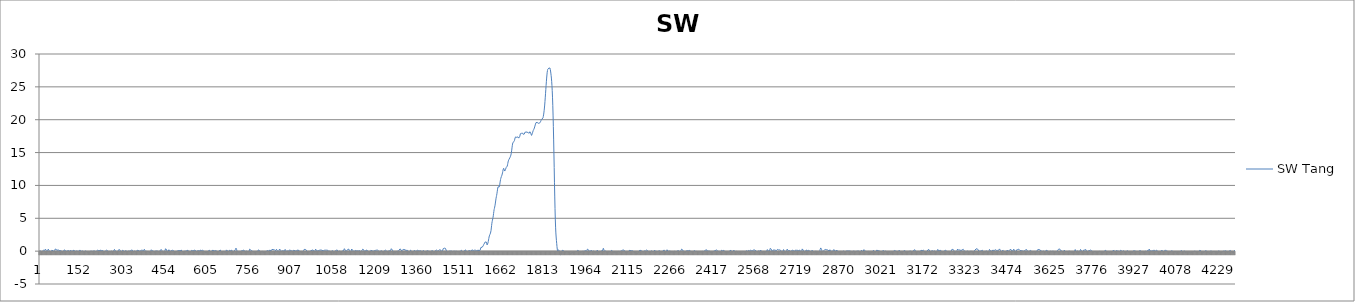
| Category | SW Tang |
|---|---|
| 0 | 0.11 |
| 1 | 0.13 |
| 2 | 0.06 |
| 3 | -0.02 |
| 4 | -0.09 |
| 5 | -0.11 |
| 6 | -0.11 |
| 7 | -0.04 |
| 8 | -0.02 |
| 9 | 0.02 |
| 10 | 0.09 |
| 11 | 0.11 |
| 12 | 0.13 |
| 13 | 0.13 |
| 14 | 0.13 |
| 15 | 0.11 |
| 16 | 0.11 |
| 17 | 0.15 |
| 18 | 0.19 |
| 19 | 0.3 |
| 20 | 0.28 |
| 21 | 0.21 |
| 22 | 0.09 |
| 23 | -0.09 |
| 24 | -0.17 |
| 25 | -0.17 |
| 26 | -0.09 |
| 27 | 0.06 |
| 28 | 0.21 |
| 29 | 0.3 |
| 30 | 0.28 |
| 31 | 0.24 |
| 32 | 0.09 |
| 33 | -0.02 |
| 34 | -0.13 |
| 35 | -0.21 |
| 36 | -0.19 |
| 37 | -0.15 |
| 38 | -0.06 |
| 39 | 0.02 |
| 40 | 0.09 |
| 41 | 0.09 |
| 42 | 0.13 |
| 43 | 0.11 |
| 44 | 0.13 |
| 45 | 0.09 |
| 46 | 0.06 |
| 47 | 0 |
| 48 | -0.06 |
| 49 | -0.09 |
| 50 | -0.09 |
| 51 | -0.02 |
| 52 | 0.09 |
| 53 | 0.21 |
| 54 | 0.32 |
| 55 | 0.41 |
| 56 | 0.41 |
| 57 | 0.39 |
| 58 | 0.26 |
| 59 | 0.17 |
| 60 | 0.09 |
| 61 | 0.04 |
| 62 | 0.09 |
| 63 | 0.15 |
| 64 | 0.21 |
| 65 | 0.28 |
| 66 | 0.26 |
| 67 | 0.19 |
| 68 | 0.09 |
| 69 | 0 |
| 70 | -0.02 |
| 71 | 0 |
| 72 | 0.09 |
| 73 | 0.13 |
| 74 | 0.15 |
| 75 | 0.13 |
| 76 | 0.04 |
| 77 | -0.06 |
| 78 | -0.15 |
| 79 | -0.26 |
| 80 | -0.32 |
| 81 | -0.32 |
| 82 | -0.28 |
| 83 | -0.17 |
| 84 | -0.02 |
| 85 | 0.11 |
| 86 | 0.19 |
| 87 | 0.26 |
| 88 | 0.21 |
| 89 | 0.19 |
| 90 | 0.11 |
| 91 | 0.06 |
| 92 | -0.02 |
| 93 | -0.06 |
| 94 | -0.04 |
| 95 | -0.04 |
| 96 | 0 |
| 97 | 0.02 |
| 98 | 0.02 |
| 99 | 0.04 |
| 100 | 0.06 |
| 101 | 0.09 |
| 102 | 0.09 |
| 103 | 0.06 |
| 104 | 0 |
| 105 | -0.04 |
| 106 | -0.04 |
| 107 | 0 |
| 108 | 0.11 |
| 109 | 0.15 |
| 110 | 0.17 |
| 111 | 0.09 |
| 112 | -0.02 |
| 113 | -0.13 |
| 114 | -0.17 |
| 115 | -0.15 |
| 116 | -0.04 |
| 117 | 0.04 |
| 118 | 0.13 |
| 119 | 0.13 |
| 120 | 0.13 |
| 121 | 0.11 |
| 122 | 0.09 |
| 123 | 0.06 |
| 124 | 0.04 |
| 125 | 0 |
| 126 | -0.04 |
| 127 | -0.11 |
| 128 | -0.09 |
| 129 | -0.09 |
| 130 | 0.02 |
| 131 | 0.04 |
| 132 | 0.06 |
| 133 | 0.02 |
| 134 | -0.02 |
| 135 | -0.09 |
| 136 | -0.15 |
| 137 | -0.15 |
| 138 | -0.06 |
| 139 | 0.02 |
| 140 | 0.11 |
| 141 | 0.17 |
| 142 | 0.19 |
| 143 | 0.17 |
| 144 | 0.11 |
| 145 | 0.04 |
| 146 | -0.02 |
| 147 | -0.04 |
| 148 | -0.04 |
| 149 | 0 |
| 150 | 0.02 |
| 151 | 0.06 |
| 152 | 0.04 |
| 153 | 0.04 |
| 154 | -0.04 |
| 155 | -0.13 |
| 156 | -0.17 |
| 157 | -0.21 |
| 158 | -0.21 |
| 159 | -0.13 |
| 160 | -0.04 |
| 161 | 0.02 |
| 162 | 0.04 |
| 163 | 0.06 |
| 164 | 0 |
| 165 | -0.02 |
| 166 | -0.06 |
| 167 | -0.11 |
| 168 | -0.17 |
| 169 | -0.19 |
| 170 | -0.24 |
| 171 | -0.26 |
| 172 | -0.3 |
| 173 | -0.3 |
| 174 | -0.28 |
| 175 | -0.26 |
| 176 | -0.19 |
| 177 | -0.13 |
| 178 | -0.09 |
| 179 | -0.06 |
| 180 | -0.04 |
| 181 | -0.02 |
| 182 | 0.02 |
| 183 | 0.02 |
| 184 | 0.04 |
| 185 | -0.02 |
| 186 | -0.06 |
| 187 | -0.11 |
| 188 | -0.15 |
| 189 | -0.09 |
| 190 | 0 |
| 191 | 0.09 |
| 192 | 0.11 |
| 193 | 0.06 |
| 194 | 0.02 |
| 195 | -0.02 |
| 196 | -0.04 |
| 197 | -0.04 |
| 198 | -0.06 |
| 199 | -0.04 |
| 200 | -0.06 |
| 201 | -0.02 |
| 202 | 0 |
| 203 | 0.02 |
| 204 | 0.09 |
| 205 | 0.13 |
| 206 | 0.15 |
| 207 | 0.15 |
| 208 | 0.13 |
| 209 | 0.09 |
| 210 | 0.06 |
| 211 | 0.02 |
| 212 | 0 |
| 213 | 0 |
| 214 | 0.09 |
| 215 | 0.15 |
| 216 | 0.19 |
| 217 | 0.19 |
| 218 | 0.17 |
| 219 | 0.06 |
| 220 | -0.04 |
| 221 | -0.11 |
| 222 | -0.04 |
| 223 | 0.02 |
| 224 | 0.11 |
| 225 | 0.15 |
| 226 | 0.11 |
| 227 | 0.02 |
| 228 | -0.11 |
| 229 | -0.21 |
| 230 | -0.24 |
| 231 | -0.21 |
| 232 | -0.13 |
| 233 | -0.04 |
| 234 | 0.04 |
| 235 | 0.09 |
| 236 | 0.09 |
| 237 | 0.13 |
| 238 | 0.15 |
| 239 | 0.17 |
| 240 | 0.19 |
| 241 | 0.15 |
| 242 | 0.04 |
| 243 | -0.11 |
| 244 | -0.19 |
| 245 | -0.19 |
| 246 | -0.15 |
| 247 | -0.09 |
| 248 | 0 |
| 249 | -0.02 |
| 250 | -0.04 |
| 251 | -0.13 |
| 252 | -0.17 |
| 253 | -0.15 |
| 254 | -0.11 |
| 255 | -0.06 |
| 256 | 0 |
| 257 | -0.04 |
| 258 | -0.09 |
| 259 | -0.13 |
| 260 | -0.13 |
| 261 | -0.09 |
| 262 | -0.04 |
| 263 | 0.04 |
| 264 | 0.13 |
| 265 | 0.19 |
| 266 | 0.26 |
| 267 | 0.24 |
| 268 | 0.21 |
| 269 | 0.13 |
| 270 | -0.02 |
| 271 | -0.19 |
| 272 | -0.3 |
| 273 | -0.37 |
| 274 | -0.34 |
| 275 | -0.26 |
| 276 | -0.17 |
| 277 | -0.13 |
| 278 | -0.04 |
| 279 | 0.04 |
| 280 | 0.13 |
| 281 | 0.21 |
| 282 | 0.3 |
| 283 | 0.32 |
| 284 | 0.3 |
| 285 | 0.21 |
| 286 | 0.15 |
| 287 | 0.04 |
| 288 | -0.06 |
| 289 | -0.13 |
| 290 | -0.15 |
| 291 | -0.17 |
| 292 | -0.13 |
| 293 | -0.09 |
| 294 | 0 |
| 295 | 0.13 |
| 296 | 0.17 |
| 297 | 0.19 |
| 298 | 0.15 |
| 299 | 0.04 |
| 300 | -0.06 |
| 301 | -0.15 |
| 302 | -0.15 |
| 303 | -0.06 |
| 304 | 0.02 |
| 305 | 0.11 |
| 306 | 0.15 |
| 307 | 0.15 |
| 308 | 0.06 |
| 309 | -0.02 |
| 310 | -0.11 |
| 311 | -0.11 |
| 312 | -0.11 |
| 313 | -0.09 |
| 314 | -0.04 |
| 315 | -0.02 |
| 316 | 0.02 |
| 317 | 0.02 |
| 318 | 0.02 |
| 319 | 0.04 |
| 320 | -0.02 |
| 321 | -0.04 |
| 322 | -0.04 |
| 323 | -0.04 |
| 324 | 0 |
| 325 | 0.09 |
| 326 | 0.17 |
| 327 | 0.26 |
| 328 | 0.28 |
| 329 | 0.24 |
| 330 | 0.15 |
| 331 | 0 |
| 332 | -0.13 |
| 333 | -0.24 |
| 334 | -0.26 |
| 335 | -0.21 |
| 336 | -0.13 |
| 337 | -0.02 |
| 338 | 0.04 |
| 339 | 0.09 |
| 340 | 0.06 |
| 341 | 0.02 |
| 342 | -0.06 |
| 343 | -0.13 |
| 344 | -0.11 |
| 345 | -0.04 |
| 346 | 0.04 |
| 347 | 0.11 |
| 348 | 0.15 |
| 349 | 0.17 |
| 350 | 0.17 |
| 351 | 0.17 |
| 352 | 0.13 |
| 353 | 0.06 |
| 354 | -0.02 |
| 355 | -0.06 |
| 356 | -0.09 |
| 357 | -0.06 |
| 358 | 0 |
| 359 | 0.09 |
| 360 | 0.13 |
| 361 | 0.13 |
| 362 | 0.13 |
| 363 | 0.13 |
| 364 | 0.13 |
| 365 | 0.13 |
| 366 | 0.13 |
| 367 | 0.11 |
| 368 | 0.06 |
| 369 | 0.02 |
| 370 | 0.06 |
| 371 | 0.13 |
| 372 | 0.21 |
| 373 | 0.28 |
| 374 | 0.28 |
| 375 | 0.17 |
| 376 | 0.04 |
| 377 | -0.11 |
| 378 | -0.21 |
| 379 | -0.17 |
| 380 | -0.11 |
| 381 | 0 |
| 382 | 0.06 |
| 383 | 0.06 |
| 384 | 0.04 |
| 385 | -0.06 |
| 386 | -0.13 |
| 387 | -0.15 |
| 388 | -0.15 |
| 389 | -0.13 |
| 390 | -0.15 |
| 391 | -0.19 |
| 392 | -0.24 |
| 393 | -0.28 |
| 394 | -0.24 |
| 395 | -0.13 |
| 396 | 0.04 |
| 397 | 0.17 |
| 398 | 0.21 |
| 399 | 0.19 |
| 400 | 0.13 |
| 401 | 0.06 |
| 402 | 0.02 |
| 403 | 0.02 |
| 404 | 0.04 |
| 405 | 0.04 |
| 406 | -0.02 |
| 407 | -0.11 |
| 408 | -0.17 |
| 409 | -0.19 |
| 410 | -0.15 |
| 411 | -0.06 |
| 412 | 0 |
| 413 | 0.06 |
| 414 | 0.09 |
| 415 | 0.06 |
| 416 | 0.02 |
| 417 | 0 |
| 418 | 0 |
| 419 | 0 |
| 420 | 0 |
| 421 | -0.02 |
| 422 | -0.04 |
| 423 | -0.06 |
| 424 | -0.11 |
| 425 | -0.17 |
| 426 | -0.17 |
| 427 | -0.13 |
| 428 | -0.09 |
| 429 | 0.04 |
| 430 | 0.15 |
| 431 | 0.26 |
| 432 | 0.3 |
| 433 | 0.28 |
| 434 | 0.24 |
| 435 | 0.15 |
| 436 | 0.06 |
| 437 | -0.04 |
| 438 | -0.11 |
| 439 | -0.15 |
| 440 | -0.21 |
| 441 | -0.28 |
| 442 | -0.32 |
| 443 | -0.3 |
| 444 | -0.24 |
| 445 | -0.15 |
| 446 | -0.02 |
| 447 | 0.13 |
| 448 | 0.26 |
| 449 | 0.37 |
| 450 | 0.45 |
| 451 | 0.43 |
| 452 | 0.32 |
| 453 | 0.17 |
| 454 | -0.04 |
| 455 | -0.19 |
| 456 | -0.28 |
| 457 | -0.24 |
| 458 | -0.11 |
| 459 | 0.04 |
| 460 | 0.19 |
| 461 | 0.28 |
| 462 | 0.28 |
| 463 | 0.21 |
| 464 | 0.11 |
| 465 | -0.02 |
| 466 | -0.09 |
| 467 | -0.11 |
| 468 | -0.09 |
| 469 | 0 |
| 470 | 0.09 |
| 471 | 0.17 |
| 472 | 0.19 |
| 473 | 0.19 |
| 474 | 0.13 |
| 475 | 0.09 |
| 476 | 0.04 |
| 477 | 0.04 |
| 478 | 0.04 |
| 479 | 0.04 |
| 480 | 0.02 |
| 481 | -0.04 |
| 482 | -0.11 |
| 483 | -0.19 |
| 484 | -0.21 |
| 485 | -0.19 |
| 486 | -0.17 |
| 487 | -0.13 |
| 488 | -0.06 |
| 489 | 0 |
| 490 | 0.02 |
| 491 | 0.04 |
| 492 | 0.04 |
| 493 | 0.04 |
| 494 | 0.04 |
| 495 | 0.04 |
| 496 | 0.06 |
| 497 | 0.09 |
| 498 | 0.09 |
| 499 | 0.11 |
| 500 | 0.06 |
| 501 | 0.04 |
| 502 | 0.04 |
| 503 | 0.06 |
| 504 | 0.11 |
| 505 | 0.17 |
| 506 | 0.19 |
| 507 | 0.13 |
| 508 | 0.02 |
| 509 | -0.11 |
| 510 | -0.17 |
| 511 | -0.19 |
| 512 | -0.17 |
| 513 | -0.15 |
| 514 | -0.09 |
| 515 | -0.04 |
| 516 | -0.02 |
| 517 | -0.02 |
| 518 | 0 |
| 519 | 0.02 |
| 520 | 0.02 |
| 521 | 0 |
| 522 | -0.02 |
| 523 | -0.02 |
| 524 | 0 |
| 525 | 0.06 |
| 526 | 0.15 |
| 527 | 0.19 |
| 528 | 0.21 |
| 529 | 0.15 |
| 530 | 0 |
| 531 | -0.11 |
| 532 | -0.21 |
| 533 | -0.26 |
| 534 | -0.24 |
| 535 | -0.15 |
| 536 | -0.13 |
| 537 | -0.13 |
| 538 | -0.15 |
| 539 | -0.15 |
| 540 | -0.13 |
| 541 | -0.02 |
| 542 | 0.11 |
| 543 | 0.21 |
| 544 | 0.21 |
| 545 | 0.17 |
| 546 | 0.06 |
| 547 | -0.02 |
| 548 | -0.06 |
| 549 | 0 |
| 550 | 0.09 |
| 551 | 0.17 |
| 552 | 0.24 |
| 553 | 0.19 |
| 554 | 0.17 |
| 555 | 0.09 |
| 556 | 0.04 |
| 557 | -0.02 |
| 558 | -0.09 |
| 559 | -0.13 |
| 560 | -0.15 |
| 561 | -0.13 |
| 562 | -0.11 |
| 563 | -0.02 |
| 564 | 0.09 |
| 565 | 0.15 |
| 566 | 0.17 |
| 567 | 0.11 |
| 568 | 0.04 |
| 569 | -0.06 |
| 570 | -0.09 |
| 571 | -0.09 |
| 572 | 0 |
| 573 | 0.11 |
| 574 | 0.17 |
| 575 | 0.17 |
| 576 | 0.13 |
| 577 | 0.11 |
| 578 | 0.09 |
| 579 | 0.09 |
| 580 | 0.13 |
| 581 | 0.15 |
| 582 | 0.13 |
| 583 | 0.11 |
| 584 | 0.04 |
| 585 | 0.02 |
| 586 | -0.02 |
| 587 | -0.02 |
| 588 | -0.04 |
| 589 | -0.11 |
| 590 | -0.19 |
| 591 | -0.26 |
| 592 | -0.32 |
| 593 | -0.3 |
| 594 | -0.26 |
| 595 | -0.17 |
| 596 | -0.13 |
| 597 | -0.13 |
| 598 | -0.15 |
| 599 | -0.13 |
| 600 | -0.13 |
| 601 | -0.04 |
| 602 | 0.04 |
| 603 | 0.15 |
| 604 | 0.19 |
| 605 | 0.17 |
| 606 | 0.13 |
| 607 | 0.02 |
| 608 | -0.09 |
| 609 | -0.15 |
| 610 | -0.15 |
| 611 | -0.15 |
| 612 | -0.09 |
| 613 | -0.04 |
| 614 | 0.04 |
| 615 | 0.09 |
| 616 | 0.13 |
| 617 | 0.17 |
| 618 | 0.15 |
| 619 | 0.13 |
| 620 | 0.09 |
| 621 | 0.06 |
| 622 | 0.04 |
| 623 | 0.02 |
| 624 | 0.06 |
| 625 | 0.09 |
| 626 | 0.11 |
| 627 | 0.09 |
| 628 | 0.06 |
| 629 | 0.02 |
| 630 | 0.02 |
| 631 | 0.02 |
| 632 | 0.04 |
| 633 | 0.02 |
| 634 | -0.02 |
| 635 | -0.09 |
| 636 | -0.15 |
| 637 | -0.19 |
| 638 | -0.19 |
| 639 | -0.15 |
| 640 | -0.06 |
| 641 | 0.06 |
| 642 | 0.15 |
| 643 | 0.19 |
| 644 | 0.19 |
| 645 | 0.17 |
| 646 | 0.09 |
| 647 | -0.02 |
| 648 | -0.11 |
| 649 | -0.15 |
| 650 | -0.17 |
| 651 | -0.13 |
| 652 | -0.11 |
| 653 | -0.11 |
| 654 | -0.09 |
| 655 | -0.06 |
| 656 | -0.06 |
| 657 | -0.04 |
| 658 | 0 |
| 659 | -0.04 |
| 660 | -0.06 |
| 661 | -0.15 |
| 662 | -0.21 |
| 663 | -0.21 |
| 664 | -0.15 |
| 665 | -0.02 |
| 666 | 0.09 |
| 667 | 0.19 |
| 668 | 0.24 |
| 669 | 0.21 |
| 670 | 0.11 |
| 671 | 0 |
| 672 | -0.09 |
| 673 | -0.13 |
| 674 | -0.13 |
| 675 | -0.06 |
| 676 | 0.02 |
| 677 | 0.09 |
| 678 | 0.13 |
| 679 | 0.15 |
| 680 | 0.11 |
| 681 | 0.06 |
| 682 | 0.06 |
| 683 | 0.09 |
| 684 | 0.13 |
| 685 | 0.15 |
| 686 | 0.15 |
| 687 | 0.02 |
| 688 | -0.13 |
| 689 | -0.32 |
| 690 | -0.39 |
| 691 | -0.41 |
| 692 | -0.28 |
| 693 | -0.15 |
| 694 | -0.04 |
| 695 | 0.02 |
| 696 | 0.02 |
| 697 | 0.06 |
| 698 | 0.13 |
| 699 | 0.26 |
| 700 | 0.39 |
| 701 | 0.45 |
| 702 | 0.39 |
| 703 | 0.28 |
| 704 | 0.13 |
| 705 | -0.04 |
| 706 | -0.15 |
| 707 | -0.17 |
| 708 | -0.17 |
| 709 | -0.15 |
| 710 | -0.13 |
| 711 | -0.15 |
| 712 | -0.19 |
| 713 | -0.21 |
| 714 | -0.26 |
| 715 | -0.24 |
| 716 | -0.17 |
| 717 | -0.06 |
| 718 | 0 |
| 719 | 0.02 |
| 720 | 0.04 |
| 721 | 0.04 |
| 722 | 0.04 |
| 723 | 0.06 |
| 724 | 0.06 |
| 725 | 0.09 |
| 726 | 0.15 |
| 727 | 0.15 |
| 728 | 0.19 |
| 729 | 0.17 |
| 730 | 0.11 |
| 731 | 0.02 |
| 732 | -0.06 |
| 733 | -0.11 |
| 734 | -0.13 |
| 735 | -0.09 |
| 736 | -0.04 |
| 737 | 0.04 |
| 738 | 0.09 |
| 739 | 0.04 |
| 740 | 0.02 |
| 741 | -0.04 |
| 742 | -0.09 |
| 743 | -0.13 |
| 744 | -0.19 |
| 745 | -0.24 |
| 746 | -0.24 |
| 747 | -0.17 |
| 748 | 0 |
| 749 | 0.15 |
| 750 | 0.3 |
| 751 | 0.34 |
| 752 | 0.37 |
| 753 | 0.28 |
| 754 | 0.17 |
| 755 | 0.06 |
| 756 | 0.02 |
| 757 | 0.02 |
| 758 | 0 |
| 759 | 0.02 |
| 760 | 0 |
| 761 | -0.04 |
| 762 | -0.06 |
| 763 | -0.06 |
| 764 | -0.11 |
| 765 | -0.15 |
| 766 | -0.17 |
| 767 | -0.19 |
| 768 | -0.19 |
| 769 | -0.21 |
| 770 | -0.17 |
| 771 | -0.17 |
| 772 | -0.11 |
| 773 | -0.06 |
| 774 | -0.06 |
| 775 | -0.04 |
| 776 | -0.09 |
| 777 | -0.11 |
| 778 | -0.11 |
| 779 | -0.04 |
| 780 | 0.04 |
| 781 | 0.19 |
| 782 | 0.28 |
| 783 | 0.28 |
| 784 | 0.21 |
| 785 | 0.09 |
| 786 | -0.06 |
| 787 | -0.19 |
| 788 | -0.26 |
| 789 | -0.24 |
| 790 | -0.21 |
| 791 | -0.13 |
| 792 | -0.04 |
| 793 | 0 |
| 794 | 0 |
| 795 | -0.04 |
| 796 | -0.09 |
| 797 | -0.15 |
| 798 | -0.24 |
| 799 | -0.28 |
| 800 | -0.32 |
| 801 | -0.26 |
| 802 | -0.21 |
| 803 | -0.15 |
| 804 | -0.11 |
| 805 | -0.13 |
| 806 | -0.17 |
| 807 | -0.15 |
| 808 | -0.15 |
| 809 | -0.04 |
| 810 | 0 |
| 811 | 0.09 |
| 812 | 0.13 |
| 813 | 0.11 |
| 814 | 0.09 |
| 815 | 0.04 |
| 816 | 0.02 |
| 817 | -0.02 |
| 818 | -0.02 |
| 819 | 0.02 |
| 820 | 0.06 |
| 821 | 0.13 |
| 822 | 0.19 |
| 823 | 0.19 |
| 824 | 0.13 |
| 825 | 0.04 |
| 826 | 0.02 |
| 827 | 0 |
| 828 | 0.04 |
| 829 | 0.15 |
| 830 | 0.28 |
| 831 | 0.34 |
| 832 | 0.34 |
| 833 | 0.3 |
| 834 | 0.21 |
| 835 | 0.17 |
| 836 | 0.17 |
| 837 | 0.24 |
| 838 | 0.24 |
| 839 | 0.24 |
| 840 | 0.15 |
| 841 | 0.09 |
| 842 | 0.06 |
| 843 | 0.09 |
| 844 | 0.13 |
| 845 | 0.21 |
| 846 | 0.28 |
| 847 | 0.26 |
| 848 | 0.19 |
| 849 | 0.06 |
| 850 | -0.06 |
| 851 | -0.13 |
| 852 | -0.17 |
| 853 | -0.13 |
| 854 | -0.04 |
| 855 | 0.09 |
| 856 | 0.21 |
| 857 | 0.32 |
| 858 | 0.37 |
| 859 | 0.34 |
| 860 | 0.26 |
| 861 | 0.13 |
| 862 | 0.02 |
| 863 | -0.11 |
| 864 | -0.17 |
| 865 | -0.17 |
| 866 | -0.06 |
| 867 | 0.04 |
| 868 | 0.15 |
| 869 | 0.19 |
| 870 | 0.15 |
| 871 | 0.04 |
| 872 | -0.04 |
| 873 | -0.09 |
| 874 | -0.04 |
| 875 | 0.09 |
| 876 | 0.19 |
| 877 | 0.26 |
| 878 | 0.26 |
| 879 | 0.17 |
| 880 | 0.04 |
| 881 | -0.06 |
| 882 | -0.13 |
| 883 | -0.09 |
| 884 | -0.04 |
| 885 | 0.04 |
| 886 | 0.04 |
| 887 | 0.06 |
| 888 | 0.02 |
| 889 | -0.02 |
| 890 | 0 |
| 891 | 0.04 |
| 892 | 0.13 |
| 893 | 0.19 |
| 894 | 0.21 |
| 895 | 0.17 |
| 896 | 0.13 |
| 897 | 0.09 |
| 898 | 0.06 |
| 899 | 0.04 |
| 900 | 0.02 |
| 901 | 0.02 |
| 902 | -0.02 |
| 903 | -0.04 |
| 904 | -0.04 |
| 905 | -0.02 |
| 906 | 0.04 |
| 907 | 0.11 |
| 908 | 0.15 |
| 909 | 0.17 |
| 910 | 0.15 |
| 911 | 0.11 |
| 912 | 0.06 |
| 913 | 0 |
| 914 | -0.02 |
| 915 | -0.06 |
| 916 | -0.04 |
| 917 | 0 |
| 918 | 0.06 |
| 919 | 0.13 |
| 920 | 0.17 |
| 921 | 0.17 |
| 922 | 0.17 |
| 923 | 0.15 |
| 924 | 0.13 |
| 925 | 0.11 |
| 926 | 0.11 |
| 927 | 0.09 |
| 928 | 0.04 |
| 929 | 0 |
| 930 | -0.04 |
| 931 | -0.09 |
| 932 | -0.15 |
| 933 | -0.19 |
| 934 | -0.19 |
| 935 | -0.17 |
| 936 | -0.15 |
| 937 | -0.09 |
| 938 | -0.11 |
| 939 | -0.11 |
| 940 | -0.11 |
| 941 | -0.09 |
| 942 | -0.02 |
| 943 | 0.09 |
| 944 | 0.19 |
| 945 | 0.26 |
| 946 | 0.3 |
| 947 | 0.3 |
| 948 | 0.28 |
| 949 | 0.26 |
| 950 | 0.28 |
| 951 | 0.24 |
| 952 | 0.19 |
| 953 | 0.15 |
| 954 | 0.04 |
| 955 | -0.06 |
| 956 | -0.17 |
| 957 | -0.26 |
| 958 | -0.3 |
| 959 | -0.28 |
| 960 | -0.21 |
| 961 | -0.15 |
| 962 | -0.09 |
| 963 | -0.04 |
| 964 | -0.04 |
| 965 | -0.06 |
| 966 | -0.11 |
| 967 | -0.09 |
| 968 | -0.02 |
| 969 | 0.04 |
| 970 | 0.15 |
| 971 | 0.17 |
| 972 | 0.17 |
| 973 | 0.15 |
| 974 | 0.15 |
| 975 | 0.15 |
| 976 | 0.17 |
| 977 | 0.17 |
| 978 | 0.11 |
| 979 | -0.02 |
| 980 | -0.11 |
| 981 | -0.19 |
| 982 | -0.19 |
| 983 | -0.09 |
| 984 | 0.06 |
| 985 | 0.19 |
| 986 | 0.3 |
| 987 | 0.3 |
| 988 | 0.19 |
| 989 | 0.11 |
| 990 | -0.02 |
| 991 | -0.02 |
| 992 | -0.04 |
| 993 | 0.04 |
| 994 | 0.11 |
| 995 | 0.13 |
| 996 | 0.13 |
| 997 | 0.09 |
| 998 | 0.09 |
| 999 | 0.06 |
| 1000 | 0.11 |
| 1001 | 0.15 |
| 1002 | 0.19 |
| 1003 | 0.19 |
| 1004 | 0.21 |
| 1005 | 0.17 |
| 1006 | 0.13 |
| 1007 | 0.11 |
| 1008 | 0.13 |
| 1009 | 0.13 |
| 1010 | 0.11 |
| 1011 | 0.11 |
| 1012 | 0.06 |
| 1013 | 0.04 |
| 1014 | 0.02 |
| 1015 | 0.06 |
| 1016 | 0.09 |
| 1017 | 0.13 |
| 1018 | 0.17 |
| 1019 | 0.17 |
| 1020 | 0.17 |
| 1021 | 0.15 |
| 1022 | 0.13 |
| 1023 | 0.13 |
| 1024 | 0.13 |
| 1025 | 0.15 |
| 1026 | 0.15 |
| 1027 | 0.17 |
| 1028 | 0.17 |
| 1029 | 0.15 |
| 1030 | 0.11 |
| 1031 | 0.04 |
| 1032 | -0.02 |
| 1033 | -0.04 |
| 1034 | -0.06 |
| 1035 | -0.02 |
| 1036 | 0.02 |
| 1037 | 0.02 |
| 1038 | -0.04 |
| 1039 | -0.15 |
| 1040 | -0.26 |
| 1041 | -0.34 |
| 1042 | -0.37 |
| 1043 | -0.28 |
| 1044 | -0.17 |
| 1045 | -0.02 |
| 1046 | 0.09 |
| 1047 | 0.11 |
| 1048 | 0 |
| 1049 | -0.15 |
| 1050 | -0.3 |
| 1051 | -0.39 |
| 1052 | -0.41 |
| 1053 | -0.32 |
| 1054 | -0.21 |
| 1055 | -0.11 |
| 1056 | -0.04 |
| 1057 | -0.02 |
| 1058 | 0 |
| 1059 | 0.06 |
| 1060 | 0.17 |
| 1061 | 0.26 |
| 1062 | 0.3 |
| 1063 | 0.24 |
| 1064 | 0.15 |
| 1065 | 0 |
| 1066 | -0.15 |
| 1067 | -0.19 |
| 1068 | -0.17 |
| 1069 | -0.11 |
| 1070 | 0 |
| 1071 | 0.06 |
| 1072 | 0.09 |
| 1073 | 0.02 |
| 1074 | -0.04 |
| 1075 | -0.13 |
| 1076 | -0.19 |
| 1077 | -0.19 |
| 1078 | -0.17 |
| 1079 | -0.13 |
| 1080 | -0.04 |
| 1081 | 0 |
| 1082 | -0.02 |
| 1083 | -0.02 |
| 1084 | -0.02 |
| 1085 | 0.04 |
| 1086 | 0.11 |
| 1087 | 0.21 |
| 1088 | 0.32 |
| 1089 | 0.37 |
| 1090 | 0.34 |
| 1091 | 0.26 |
| 1092 | 0.15 |
| 1093 | 0 |
| 1094 | -0.06 |
| 1095 | -0.11 |
| 1096 | -0.09 |
| 1097 | -0.04 |
| 1098 | 0.06 |
| 1099 | 0.13 |
| 1100 | 0.19 |
| 1101 | 0.26 |
| 1102 | 0.32 |
| 1103 | 0.37 |
| 1104 | 0.37 |
| 1105 | 0.3 |
| 1106 | 0.19 |
| 1107 | 0.06 |
| 1108 | -0.06 |
| 1109 | -0.19 |
| 1110 | -0.26 |
| 1111 | -0.26 |
| 1112 | -0.19 |
| 1113 | -0.04 |
| 1114 | 0.15 |
| 1115 | 0.32 |
| 1116 | 0.43 |
| 1117 | 0.39 |
| 1118 | 0.28 |
| 1119 | 0.13 |
| 1120 | -0.04 |
| 1121 | -0.13 |
| 1122 | -0.17 |
| 1123 | -0.11 |
| 1124 | -0.06 |
| 1125 | 0 |
| 1126 | 0.02 |
| 1127 | 0.06 |
| 1128 | 0.09 |
| 1129 | 0.11 |
| 1130 | 0.06 |
| 1131 | 0.09 |
| 1132 | 0.04 |
| 1133 | 0 |
| 1134 | 0 |
| 1135 | 0.04 |
| 1136 | 0.04 |
| 1137 | 0.06 |
| 1138 | 0.09 |
| 1139 | 0.04 |
| 1140 | 0.02 |
| 1141 | 0.02 |
| 1142 | 0.04 |
| 1143 | 0.06 |
| 1144 | 0.06 |
| 1145 | 0.02 |
| 1146 | -0.02 |
| 1147 | -0.06 |
| 1148 | -0.11 |
| 1149 | -0.09 |
| 1150 | -0.02 |
| 1151 | 0.04 |
| 1152 | 0.13 |
| 1153 | 0.19 |
| 1154 | 0.24 |
| 1155 | 0.3 |
| 1156 | 0.32 |
| 1157 | 0.32 |
| 1158 | 0.26 |
| 1159 | 0.15 |
| 1160 | 0 |
| 1161 | -0.13 |
| 1162 | -0.19 |
| 1163 | -0.19 |
| 1164 | -0.13 |
| 1165 | -0.02 |
| 1166 | 0.09 |
| 1167 | 0.17 |
| 1168 | 0.21 |
| 1169 | 0.21 |
| 1170 | 0.17 |
| 1171 | 0.11 |
| 1172 | 0.04 |
| 1173 | 0 |
| 1174 | -0.04 |
| 1175 | -0.06 |
| 1176 | -0.11 |
| 1177 | -0.15 |
| 1178 | -0.19 |
| 1179 | -0.24 |
| 1180 | -0.21 |
| 1181 | -0.15 |
| 1182 | -0.06 |
| 1183 | 0.06 |
| 1184 | 0.13 |
| 1185 | 0.17 |
| 1186 | 0.15 |
| 1187 | 0.09 |
| 1188 | 0.04 |
| 1189 | -0.02 |
| 1190 | -0.06 |
| 1191 | -0.04 |
| 1192 | -0.04 |
| 1193 | -0.02 |
| 1194 | 0.02 |
| 1195 | 0.04 |
| 1196 | 0.06 |
| 1197 | 0.09 |
| 1198 | 0.09 |
| 1199 | 0.13 |
| 1200 | 0.11 |
| 1201 | 0.13 |
| 1202 | 0.15 |
| 1203 | 0.17 |
| 1204 | 0.15 |
| 1205 | 0.13 |
| 1206 | 0.13 |
| 1207 | 0.15 |
| 1208 | 0.15 |
| 1209 | 0.17 |
| 1210 | 0.15 |
| 1211 | 0.11 |
| 1212 | 0.02 |
| 1213 | -0.11 |
| 1214 | -0.17 |
| 1215 | -0.26 |
| 1216 | -0.24 |
| 1217 | -0.19 |
| 1218 | -0.11 |
| 1219 | -0.04 |
| 1220 | 0.04 |
| 1221 | 0.09 |
| 1222 | 0.09 |
| 1223 | 0.02 |
| 1224 | -0.04 |
| 1225 | -0.15 |
| 1226 | -0.26 |
| 1227 | -0.28 |
| 1228 | -0.24 |
| 1229 | -0.15 |
| 1230 | -0.06 |
| 1231 | -0.02 |
| 1232 | 0.04 |
| 1233 | 0.06 |
| 1234 | 0.06 |
| 1235 | 0.13 |
| 1236 | 0.15 |
| 1237 | 0.17 |
| 1238 | 0.15 |
| 1239 | 0.09 |
| 1240 | 0 |
| 1241 | -0.06 |
| 1242 | -0.11 |
| 1243 | -0.13 |
| 1244 | -0.11 |
| 1245 | -0.09 |
| 1246 | -0.02 |
| 1247 | 0.02 |
| 1248 | 0.02 |
| 1249 | 0.02 |
| 1250 | 0.04 |
| 1251 | 0.02 |
| 1252 | 0.02 |
| 1253 | 0.04 |
| 1254 | 0.09 |
| 1255 | 0.19 |
| 1256 | 0.28 |
| 1257 | 0.37 |
| 1258 | 0.39 |
| 1259 | 0.34 |
| 1260 | 0.24 |
| 1261 | 0.15 |
| 1262 | 0.04 |
| 1263 | -0.02 |
| 1264 | -0.04 |
| 1265 | -0.09 |
| 1266 | -0.17 |
| 1267 | -0.24 |
| 1268 | -0.3 |
| 1269 | -0.34 |
| 1270 | -0.37 |
| 1271 | -0.32 |
| 1272 | -0.26 |
| 1273 | -0.15 |
| 1274 | -0.09 |
| 1275 | 0 |
| 1276 | 0 |
| 1277 | -0.02 |
| 1278 | -0.04 |
| 1279 | -0.09 |
| 1280 | -0.09 |
| 1281 | -0.02 |
| 1282 | 0.02 |
| 1283 | 0.09 |
| 1284 | 0.13 |
| 1285 | 0.15 |
| 1286 | 0.19 |
| 1287 | 0.28 |
| 1288 | 0.34 |
| 1289 | 0.39 |
| 1290 | 0.39 |
| 1291 | 0.3 |
| 1292 | 0.21 |
| 1293 | 0.09 |
| 1294 | 0.02 |
| 1295 | 0.02 |
| 1296 | 0.06 |
| 1297 | 0.13 |
| 1298 | 0.19 |
| 1299 | 0.26 |
| 1300 | 0.28 |
| 1301 | 0.26 |
| 1302 | 0.26 |
| 1303 | 0.21 |
| 1304 | 0.17 |
| 1305 | 0.17 |
| 1306 | 0.19 |
| 1307 | 0.19 |
| 1308 | 0.17 |
| 1309 | 0.15 |
| 1310 | 0.11 |
| 1311 | 0.11 |
| 1312 | 0.11 |
| 1313 | 0.13 |
| 1314 | 0.13 |
| 1315 | 0.13 |
| 1316 | 0.13 |
| 1317 | 0.09 |
| 1318 | 0 |
| 1319 | -0.11 |
| 1320 | -0.24 |
| 1321 | -0.28 |
| 1322 | -0.28 |
| 1323 | -0.21 |
| 1324 | -0.09 |
| 1325 | 0.04 |
| 1326 | 0.15 |
| 1327 | 0.21 |
| 1328 | 0.19 |
| 1329 | 0.11 |
| 1330 | -0.02 |
| 1331 | -0.15 |
| 1332 | -0.26 |
| 1333 | -0.28 |
| 1334 | -0.26 |
| 1335 | -0.19 |
| 1336 | -0.09 |
| 1337 | 0 |
| 1338 | 0.06 |
| 1339 | 0.11 |
| 1340 | 0.11 |
| 1341 | 0.11 |
| 1342 | 0.02 |
| 1343 | -0.02 |
| 1344 | -0.09 |
| 1345 | -0.09 |
| 1346 | -0.04 |
| 1347 | 0.02 |
| 1348 | 0.11 |
| 1349 | 0.13 |
| 1350 | 0.17 |
| 1351 | 0.13 |
| 1352 | 0.11 |
| 1353 | 0.04 |
| 1354 | 0.04 |
| 1355 | 0.04 |
| 1356 | 0.06 |
| 1357 | 0.06 |
| 1358 | 0.02 |
| 1359 | 0.02 |
| 1360 | 0 |
| 1361 | 0.02 |
| 1362 | 0.06 |
| 1363 | 0.04 |
| 1364 | 0.02 |
| 1365 | 0 |
| 1366 | -0.06 |
| 1367 | -0.11 |
| 1368 | -0.09 |
| 1369 | -0.04 |
| 1370 | 0.02 |
| 1371 | 0.09 |
| 1372 | 0.09 |
| 1373 | 0.04 |
| 1374 | 0 |
| 1375 | -0.04 |
| 1376 | -0.11 |
| 1377 | -0.11 |
| 1378 | -0.11 |
| 1379 | -0.15 |
| 1380 | -0.15 |
| 1381 | -0.15 |
| 1382 | -0.09 |
| 1383 | -0.02 |
| 1384 | 0.06 |
| 1385 | 0.11 |
| 1386 | 0.09 |
| 1387 | 0.06 |
| 1388 | 0 |
| 1389 | -0.04 |
| 1390 | -0.04 |
| 1391 | -0.04 |
| 1392 | -0.02 |
| 1393 | -0.04 |
| 1394 | -0.06 |
| 1395 | -0.13 |
| 1396 | -0.21 |
| 1397 | -0.26 |
| 1398 | -0.32 |
| 1399 | -0.32 |
| 1400 | -0.28 |
| 1401 | -0.15 |
| 1402 | 0 |
| 1403 | 0.11 |
| 1404 | 0.15 |
| 1405 | 0.13 |
| 1406 | -0.02 |
| 1407 | -0.19 |
| 1408 | -0.3 |
| 1409 | -0.39 |
| 1410 | -0.34 |
| 1411 | -0.26 |
| 1412 | -0.15 |
| 1413 | -0.02 |
| 1414 | 0.02 |
| 1415 | 0.11 |
| 1416 | 0.15 |
| 1417 | 0.17 |
| 1418 | 0.17 |
| 1419 | 0.15 |
| 1420 | 0.11 |
| 1421 | 0.04 |
| 1422 | 0.02 |
| 1423 | -0.02 |
| 1424 | 0 |
| 1425 | 0.04 |
| 1426 | 0.09 |
| 1427 | 0.13 |
| 1428 | 0.15 |
| 1429 | 0.19 |
| 1430 | 0.21 |
| 1431 | 0.26 |
| 1432 | 0.28 |
| 1433 | 0.28 |
| 1434 | 0.17 |
| 1435 | 0.04 |
| 1436 | -0.11 |
| 1437 | -0.21 |
| 1438 | -0.24 |
| 1439 | -0.17 |
| 1440 | -0.02 |
| 1441 | 0.15 |
| 1442 | 0.28 |
| 1443 | 0.39 |
| 1444 | 0.41 |
| 1445 | 0.41 |
| 1446 | 0.43 |
| 1447 | 0.45 |
| 1448 | 0.49 |
| 1449 | 0.52 |
| 1450 | 0.49 |
| 1451 | 0.41 |
| 1452 | 0.3 |
| 1453 | 0.17 |
| 1454 | 0.06 |
| 1455 | -0.02 |
| 1456 | -0.09 |
| 1457 | -0.15 |
| 1458 | -0.19 |
| 1459 | -0.21 |
| 1460 | -0.19 |
| 1461 | -0.15 |
| 1462 | -0.06 |
| 1463 | 0 |
| 1464 | 0.04 |
| 1465 | 0.06 |
| 1466 | 0 |
| 1467 | -0.04 |
| 1468 | -0.09 |
| 1469 | -0.06 |
| 1470 | 0 |
| 1471 | 0.06 |
| 1472 | 0.09 |
| 1473 | 0.04 |
| 1474 | 0 |
| 1475 | -0.13 |
| 1476 | -0.17 |
| 1477 | -0.19 |
| 1478 | -0.17 |
| 1479 | -0.09 |
| 1480 | -0.02 |
| 1481 | 0 |
| 1482 | 0.02 |
| 1483 | 0 |
| 1484 | -0.02 |
| 1485 | -0.09 |
| 1486 | -0.09 |
| 1487 | -0.11 |
| 1488 | -0.04 |
| 1489 | 0 |
| 1490 | 0.02 |
| 1491 | 0.02 |
| 1492 | -0.02 |
| 1493 | -0.09 |
| 1494 | -0.13 |
| 1495 | -0.13 |
| 1496 | -0.13 |
| 1497 | -0.11 |
| 1498 | -0.09 |
| 1499 | -0.04 |
| 1500 | -0.06 |
| 1501 | -0.06 |
| 1502 | -0.06 |
| 1503 | -0.06 |
| 1504 | -0.02 |
| 1505 | 0.02 |
| 1506 | 0.11 |
| 1507 | 0.13 |
| 1508 | 0.13 |
| 1509 | 0.09 |
| 1510 | 0 |
| 1511 | -0.09 |
| 1512 | -0.15 |
| 1513 | -0.19 |
| 1514 | -0.15 |
| 1515 | -0.13 |
| 1516 | -0.06 |
| 1517 | 0 |
| 1518 | 0.02 |
| 1519 | 0.09 |
| 1520 | 0.17 |
| 1521 | 0.24 |
| 1522 | 0.24 |
| 1523 | 0.19 |
| 1524 | 0.11 |
| 1525 | -0.04 |
| 1526 | -0.15 |
| 1527 | -0.19 |
| 1528 | -0.19 |
| 1529 | -0.13 |
| 1530 | -0.04 |
| 1531 | -0.02 |
| 1532 | 0 |
| 1533 | 0.02 |
| 1534 | 0.04 |
| 1535 | 0.06 |
| 1536 | 0.06 |
| 1537 | 0.09 |
| 1538 | 0.04 |
| 1539 | 0.04 |
| 1540 | 0 |
| 1541 | -0.02 |
| 1542 | 0 |
| 1543 | 0.02 |
| 1544 | 0.09 |
| 1545 | 0.17 |
| 1546 | 0.24 |
| 1547 | 0.28 |
| 1548 | 0.24 |
| 1549 | 0.17 |
| 1550 | 0.11 |
| 1551 | 0 |
| 1552 | -0.06 |
| 1553 | -0.04 |
| 1554 | 0.04 |
| 1555 | 0.15 |
| 1556 | 0.21 |
| 1557 | 0.24 |
| 1558 | 0.19 |
| 1559 | 0.13 |
| 1560 | 0.06 |
| 1561 | 0.02 |
| 1562 | 0.02 |
| 1563 | 0.02 |
| 1564 | 0.04 |
| 1565 | 0.09 |
| 1566 | 0.13 |
| 1567 | 0.19 |
| 1568 | 0.21 |
| 1569 | 0.19 |
| 1570 | 0.13 |
| 1571 | 0.04 |
| 1572 | -0.04 |
| 1573 | -0.06 |
| 1574 | 0 |
| 1575 | 0.13 |
| 1576 | 0.32 |
| 1577 | 0.47 |
| 1578 | 0.58 |
| 1579 | 0.64 |
| 1580 | 0.67 |
| 1581 | 0.6 |
| 1582 | 0.58 |
| 1583 | 0.56 |
| 1584 | 0.6 |
| 1585 | 0.69 |
| 1586 | 0.82 |
| 1587 | 0.95 |
| 1588 | 1.03 |
| 1589 | 1.1 |
| 1590 | 1.18 |
| 1591 | 1.23 |
| 1592 | 1.31 |
| 1593 | 1.4 |
| 1594 | 1.53 |
| 1595 | 1.53 |
| 1596 | 1.48 |
| 1597 | 1.38 |
| 1598 | 1.2 |
| 1599 | 1.05 |
| 1600 | 0.95 |
| 1601 | 0.97 |
| 1602 | 1.08 |
| 1603 | 1.25 |
| 1604 | 1.48 |
| 1605 | 1.7 |
| 1606 | 1.93 |
| 1607 | 2.15 |
| 1608 | 2.32 |
| 1609 | 2.45 |
| 1610 | 2.54 |
| 1611 | 2.64 |
| 1612 | 2.75 |
| 1613 | 2.9 |
| 1614 | 3.16 |
| 1615 | 3.53 |
| 1616 | 3.89 |
| 1617 | 4.24 |
| 1618 | 4.49 |
| 1619 | 4.71 |
| 1620 | 4.9 |
| 1621 | 5.12 |
| 1622 | 5.38 |
| 1623 | 5.72 |
| 1624 | 6.02 |
| 1625 | 6.32 |
| 1626 | 6.49 |
| 1627 | 6.71 |
| 1628 | 6.9 |
| 1629 | 7.18 |
| 1630 | 7.48 |
| 1631 | 7.78 |
| 1632 | 8.06 |
| 1633 | 8.28 |
| 1634 | 8.49 |
| 1635 | 8.73 |
| 1636 | 9.03 |
| 1637 | 9.33 |
| 1638 | 9.61 |
| 1639 | 9.78 |
| 1640 | 9.83 |
| 1641 | 9.78 |
| 1642 | 9.76 |
| 1643 | 9.76 |
| 1644 | 9.89 |
| 1645 | 10.1 |
| 1646 | 10.38 |
| 1647 | 10.66 |
| 1648 | 10.9 |
| 1649 | 11.09 |
| 1650 | 11.22 |
| 1651 | 11.35 |
| 1652 | 11.46 |
| 1653 | 11.57 |
| 1654 | 11.72 |
| 1655 | 11.91 |
| 1656 | 12.1 |
| 1657 | 12.36 |
| 1658 | 12.51 |
| 1659 | 12.6 |
| 1660 | 12.56 |
| 1661 | 12.43 |
| 1662 | 12.3 |
| 1663 | 12.19 |
| 1664 | 12.19 |
| 1665 | 12.32 |
| 1666 | 12.45 |
| 1667 | 12.6 |
| 1668 | 12.71 |
| 1669 | 12.77 |
| 1670 | 12.77 |
| 1671 | 12.81 |
| 1672 | 12.94 |
| 1673 | 13.14 |
| 1674 | 13.35 |
| 1675 | 13.57 |
| 1676 | 13.74 |
| 1677 | 13.87 |
| 1678 | 13.95 |
| 1679 | 14.02 |
| 1680 | 14.1 |
| 1681 | 14.19 |
| 1682 | 14.28 |
| 1683 | 14.36 |
| 1684 | 14.45 |
| 1685 | 14.62 |
| 1686 | 14.81 |
| 1687 | 15.07 |
| 1688 | 15.37 |
| 1689 | 15.72 |
| 1690 | 16.04 |
| 1691 | 16.3 |
| 1692 | 16.47 |
| 1693 | 16.58 |
| 1694 | 16.62 |
| 1695 | 16.64 |
| 1696 | 16.64 |
| 1697 | 16.71 |
| 1698 | 16.86 |
| 1699 | 17.05 |
| 1700 | 17.22 |
| 1701 | 17.33 |
| 1702 | 17.39 |
| 1703 | 17.39 |
| 1704 | 17.33 |
| 1705 | 17.31 |
| 1706 | 17.31 |
| 1707 | 17.33 |
| 1708 | 17.37 |
| 1709 | 17.39 |
| 1710 | 17.39 |
| 1711 | 17.33 |
| 1712 | 17.29 |
| 1713 | 17.2 |
| 1714 | 17.16 |
| 1715 | 17.2 |
| 1716 | 17.29 |
| 1717 | 17.48 |
| 1718 | 17.67 |
| 1719 | 17.87 |
| 1720 | 17.97 |
| 1721 | 18 |
| 1722 | 17.97 |
| 1723 | 17.93 |
| 1724 | 17.93 |
| 1725 | 17.95 |
| 1726 | 17.95 |
| 1727 | 17.95 |
| 1728 | 17.89 |
| 1729 | 17.78 |
| 1730 | 17.69 |
| 1731 | 17.67 |
| 1732 | 17.69 |
| 1733 | 17.82 |
| 1734 | 17.95 |
| 1735 | 18.08 |
| 1736 | 18.12 |
| 1737 | 18.17 |
| 1738 | 18.15 |
| 1739 | 18.12 |
| 1740 | 18.12 |
| 1741 | 18.12 |
| 1742 | 18.1 |
| 1743 | 18.12 |
| 1744 | 18.1 |
| 1745 | 18.08 |
| 1746 | 18.02 |
| 1747 | 18 |
| 1748 | 17.93 |
| 1749 | 17.91 |
| 1750 | 17.91 |
| 1751 | 17.97 |
| 1752 | 18.08 |
| 1753 | 18.17 |
| 1754 | 18.19 |
| 1755 | 18.12 |
| 1756 | 18 |
| 1757 | 17.82 |
| 1758 | 17.67 |
| 1759 | 17.61 |
| 1760 | 17.65 |
| 1761 | 17.76 |
| 1762 | 17.93 |
| 1763 | 18.1 |
| 1764 | 18.25 |
| 1765 | 18.36 |
| 1766 | 18.47 |
| 1767 | 18.53 |
| 1768 | 18.66 |
| 1769 | 18.73 |
| 1770 | 18.86 |
| 1771 | 19.03 |
| 1772 | 19.18 |
| 1773 | 19.33 |
| 1774 | 19.48 |
| 1775 | 19.56 |
| 1776 | 19.63 |
| 1777 | 19.63 |
| 1778 | 19.63 |
| 1779 | 19.59 |
| 1780 | 19.56 |
| 1781 | 19.52 |
| 1782 | 19.5 |
| 1783 | 19.46 |
| 1784 | 19.44 |
| 1785 | 19.44 |
| 1786 | 19.44 |
| 1787 | 19.46 |
| 1788 | 19.5 |
| 1789 | 19.54 |
| 1790 | 19.59 |
| 1791 | 19.69 |
| 1792 | 19.8 |
| 1793 | 19.89 |
| 1794 | 19.99 |
| 1795 | 20.04 |
| 1796 | 20.08 |
| 1797 | 20.08 |
| 1798 | 20.1 |
| 1799 | 20.19 |
| 1800 | 20.3 |
| 1801 | 20.49 |
| 1802 | 20.73 |
| 1803 | 21.03 |
| 1804 | 21.37 |
| 1805 | 21.78 |
| 1806 | 22.23 |
| 1807 | 22.75 |
| 1808 | 23.33 |
| 1809 | 23.95 |
| 1810 | 24.57 |
| 1811 | 25.2 |
| 1812 | 25.78 |
| 1813 | 26.34 |
| 1814 | 26.81 |
| 1815 | 27.22 |
| 1816 | 27.48 |
| 1817 | 27.67 |
| 1818 | 27.73 |
| 1819 | 27.78 |
| 1820 | 27.8 |
| 1821 | 27.86 |
| 1822 | 27.93 |
| 1823 | 27.99 |
| 1824 | 27.95 |
| 1825 | 27.86 |
| 1826 | 27.65 |
| 1827 | 27.41 |
| 1828 | 27.09 |
| 1829 | 26.75 |
| 1830 | 26.34 |
| 1831 | 25.84 |
| 1832 | 25.2 |
| 1833 | 24.42 |
| 1834 | 23.43 |
| 1835 | 22.19 |
| 1836 | 20.7 |
| 1837 | 18.98 |
| 1838 | 17.05 |
| 1839 | 14.94 |
| 1840 | 12.73 |
| 1841 | 10.49 |
| 1842 | 8.38 |
| 1843 | 6.47 |
| 1844 | 4.88 |
| 1845 | 3.65 |
| 1846 | 2.77 |
| 1847 | 2.15 |
| 1848 | 1.63 |
| 1849 | 1.18 |
| 1850 | 0.71 |
| 1851 | 0.32 |
| 1852 | 0.04 |
| 1853 | -0.04 |
| 1854 | 0.02 |
| 1855 | 0.13 |
| 1856 | 0.19 |
| 1857 | 0.17 |
| 1858 | 0.02 |
| 1859 | -0.13 |
| 1860 | -0.28 |
| 1861 | -0.43 |
| 1862 | -0.56 |
| 1863 | -0.64 |
| 1864 | -0.67 |
| 1865 | -0.62 |
| 1866 | -0.47 |
| 1867 | -0.26 |
| 1868 | -0.04 |
| 1869 | 0.13 |
| 1870 | 0.21 |
| 1871 | 0.19 |
| 1872 | 0.15 |
| 1873 | 0.09 |
| 1874 | 0.02 |
| 1875 | -0.02 |
| 1876 | -0.06 |
| 1877 | -0.09 |
| 1878 | -0.13 |
| 1879 | -0.19 |
| 1880 | -0.24 |
| 1881 | -0.24 |
| 1882 | -0.21 |
| 1883 | -0.15 |
| 1884 | -0.09 |
| 1885 | 0 |
| 1886 | 0 |
| 1887 | -0.04 |
| 1888 | -0.13 |
| 1889 | -0.21 |
| 1890 | -0.28 |
| 1891 | -0.28 |
| 1892 | -0.24 |
| 1893 | -0.19 |
| 1894 | -0.17 |
| 1895 | -0.17 |
| 1896 | -0.21 |
| 1897 | -0.3 |
| 1898 | -0.43 |
| 1899 | -0.49 |
| 1900 | -0.49 |
| 1901 | -0.45 |
| 1902 | -0.32 |
| 1903 | -0.24 |
| 1904 | -0.15 |
| 1905 | -0.15 |
| 1906 | -0.21 |
| 1907 | -0.26 |
| 1908 | -0.28 |
| 1909 | -0.26 |
| 1910 | -0.24 |
| 1911 | -0.19 |
| 1912 | -0.17 |
| 1913 | -0.15 |
| 1914 | -0.13 |
| 1915 | -0.13 |
| 1916 | -0.09 |
| 1917 | -0.09 |
| 1918 | -0.09 |
| 1919 | -0.09 |
| 1920 | -0.06 |
| 1921 | -0.04 |
| 1922 | -0.02 |
| 1923 | 0.04 |
| 1924 | 0.11 |
| 1925 | 0.11 |
| 1926 | 0.11 |
| 1927 | 0.06 |
| 1928 | 0.02 |
| 1929 | -0.04 |
| 1930 | -0.06 |
| 1931 | -0.09 |
| 1932 | -0.11 |
| 1933 | -0.11 |
| 1934 | -0.11 |
| 1935 | -0.15 |
| 1936 | -0.21 |
| 1937 | -0.21 |
| 1938 | -0.19 |
| 1939 | -0.17 |
| 1940 | -0.04 |
| 1941 | 0.02 |
| 1942 | 0.09 |
| 1943 | 0.04 |
| 1944 | -0.02 |
| 1945 | -0.09 |
| 1946 | -0.15 |
| 1947 | -0.15 |
| 1948 | -0.09 |
| 1949 | 0 |
| 1950 | 0.06 |
| 1951 | 0.11 |
| 1952 | 0.06 |
| 1953 | -0.02 |
| 1954 | -0.09 |
| 1955 | -0.06 |
| 1956 | 0 |
| 1957 | 0.11 |
| 1958 | 0.21 |
| 1959 | 0.3 |
| 1960 | 0.34 |
| 1961 | 0.3 |
| 1962 | 0.26 |
| 1963 | 0.19 |
| 1964 | 0.11 |
| 1965 | 0.02 |
| 1966 | -0.11 |
| 1967 | -0.19 |
| 1968 | -0.21 |
| 1969 | -0.17 |
| 1970 | -0.09 |
| 1971 | 0.09 |
| 1972 | 0.19 |
| 1973 | 0.24 |
| 1974 | 0.19 |
| 1975 | 0.06 |
| 1976 | -0.06 |
| 1977 | -0.15 |
| 1978 | -0.17 |
| 1979 | -0.09 |
| 1980 | -0.02 |
| 1981 | 0.04 |
| 1982 | 0.06 |
| 1983 | 0.04 |
| 1984 | -0.04 |
| 1985 | -0.11 |
| 1986 | -0.19 |
| 1987 | -0.26 |
| 1988 | -0.32 |
| 1989 | -0.34 |
| 1990 | -0.32 |
| 1991 | -0.24 |
| 1992 | -0.11 |
| 1993 | 0.02 |
| 1994 | 0.15 |
| 1995 | 0.19 |
| 1996 | 0.15 |
| 1997 | 0.06 |
| 1998 | -0.06 |
| 1999 | -0.17 |
| 2000 | -0.24 |
| 2001 | -0.21 |
| 2002 | -0.19 |
| 2003 | -0.13 |
| 2004 | -0.13 |
| 2005 | -0.11 |
| 2006 | -0.06 |
| 2007 | -0.02 |
| 2008 | 0.02 |
| 2009 | 0 |
| 2010 | 0 |
| 2011 | -0.02 |
| 2012 | 0 |
| 2013 | 0.06 |
| 2014 | 0.24 |
| 2015 | 0.37 |
| 2016 | 0.43 |
| 2017 | 0.43 |
| 2018 | 0.28 |
| 2019 | 0.09 |
| 2020 | -0.09 |
| 2021 | -0.17 |
| 2022 | -0.15 |
| 2023 | -0.09 |
| 2024 | 0.04 |
| 2025 | 0.11 |
| 2026 | 0.09 |
| 2027 | -0.02 |
| 2028 | -0.15 |
| 2029 | -0.26 |
| 2030 | -0.34 |
| 2031 | -0.39 |
| 2032 | -0.32 |
| 2033 | -0.28 |
| 2034 | -0.19 |
| 2035 | -0.09 |
| 2036 | 0 |
| 2037 | 0.02 |
| 2038 | 0.02 |
| 2039 | -0.06 |
| 2040 | -0.17 |
| 2041 | -0.28 |
| 2042 | -0.28 |
| 2043 | -0.19 |
| 2044 | -0.06 |
| 2045 | 0.11 |
| 2046 | 0.21 |
| 2047 | 0.21 |
| 2048 | 0.15 |
| 2049 | 0 |
| 2050 | -0.13 |
| 2051 | -0.24 |
| 2052 | -0.24 |
| 2053 | -0.19 |
| 2054 | -0.15 |
| 2055 | -0.06 |
| 2056 | -0.11 |
| 2057 | -0.21 |
| 2058 | -0.3 |
| 2059 | -0.34 |
| 2060 | -0.32 |
| 2061 | -0.26 |
| 2062 | -0.17 |
| 2063 | -0.13 |
| 2064 | -0.15 |
| 2065 | -0.15 |
| 2066 | -0.17 |
| 2067 | -0.15 |
| 2068 | -0.06 |
| 2069 | 0 |
| 2070 | 0.04 |
| 2071 | 0 |
| 2072 | -0.09 |
| 2073 | -0.15 |
| 2074 | -0.19 |
| 2075 | -0.17 |
| 2076 | -0.11 |
| 2077 | -0.04 |
| 2078 | 0 |
| 2079 | 0.02 |
| 2080 | 0.02 |
| 2081 | 0.02 |
| 2082 | 0.04 |
| 2083 | 0.13 |
| 2084 | 0.17 |
| 2085 | 0.19 |
| 2086 | 0.19 |
| 2087 | 0.17 |
| 2088 | 0.15 |
| 2089 | 0.17 |
| 2090 | 0.15 |
| 2091 | 0.13 |
| 2092 | 0.09 |
| 2093 | -0.02 |
| 2094 | -0.11 |
| 2095 | -0.19 |
| 2096 | -0.26 |
| 2097 | -0.26 |
| 2098 | -0.21 |
| 2099 | -0.24 |
| 2100 | -0.17 |
| 2101 | -0.19 |
| 2102 | -0.17 |
| 2103 | -0.15 |
| 2104 | -0.13 |
| 2105 | -0.09 |
| 2106 | -0.02 |
| 2107 | 0 |
| 2108 | 0.06 |
| 2109 | 0.13 |
| 2110 | 0.15 |
| 2111 | 0.15 |
| 2112 | 0.13 |
| 2113 | 0.09 |
| 2114 | 0.04 |
| 2115 | 0.02 |
| 2116 | 0.02 |
| 2117 | 0.02 |
| 2118 | 0.02 |
| 2119 | 0.06 |
| 2120 | 0.11 |
| 2121 | 0.11 |
| 2122 | 0.06 |
| 2123 | -0.02 |
| 2124 | -0.11 |
| 2125 | -0.17 |
| 2126 | -0.21 |
| 2127 | -0.21 |
| 2128 | -0.19 |
| 2129 | -0.17 |
| 2130 | -0.19 |
| 2131 | -0.24 |
| 2132 | -0.3 |
| 2133 | -0.37 |
| 2134 | -0.39 |
| 2135 | -0.37 |
| 2136 | -0.37 |
| 2137 | -0.37 |
| 2138 | -0.39 |
| 2139 | -0.37 |
| 2140 | -0.3 |
| 2141 | -0.24 |
| 2142 | -0.11 |
| 2143 | 0 |
| 2144 | 0.09 |
| 2145 | 0.15 |
| 2146 | 0.15 |
| 2147 | 0.13 |
| 2148 | 0.06 |
| 2149 | 0.06 |
| 2150 | 0.06 |
| 2151 | 0.09 |
| 2152 | 0.06 |
| 2153 | 0.06 |
| 2154 | 0 |
| 2155 | -0.06 |
| 2156 | -0.15 |
| 2157 | -0.17 |
| 2158 | -0.17 |
| 2159 | -0.13 |
| 2160 | -0.04 |
| 2161 | 0 |
| 2162 | 0.02 |
| 2163 | 0.02 |
| 2164 | -0.02 |
| 2165 | -0.02 |
| 2166 | 0 |
| 2167 | 0.02 |
| 2168 | 0.09 |
| 2169 | 0.13 |
| 2170 | 0.15 |
| 2171 | 0.17 |
| 2172 | 0.13 |
| 2173 | 0.09 |
| 2174 | 0.04 |
| 2175 | 0.04 |
| 2176 | 0 |
| 2177 | -0.06 |
| 2178 | -0.15 |
| 2179 | -0.17 |
| 2180 | -0.24 |
| 2181 | -0.28 |
| 2182 | -0.26 |
| 2183 | -0.21 |
| 2184 | -0.13 |
| 2185 | -0.06 |
| 2186 | 0 |
| 2187 | 0.06 |
| 2188 | 0.06 |
| 2189 | 0.04 |
| 2190 | 0 |
| 2191 | -0.02 |
| 2192 | -0.06 |
| 2193 | -0.09 |
| 2194 | -0.11 |
| 2195 | -0.13 |
| 2196 | -0.09 |
| 2197 | -0.02 |
| 2198 | 0.09 |
| 2199 | 0.13 |
| 2200 | 0.15 |
| 2201 | 0.06 |
| 2202 | -0.04 |
| 2203 | -0.17 |
| 2204 | -0.26 |
| 2205 | -0.24 |
| 2206 | -0.13 |
| 2207 | -0.02 |
| 2208 | 0.06 |
| 2209 | 0.06 |
| 2210 | 0 |
| 2211 | -0.09 |
| 2212 | -0.11 |
| 2213 | -0.09 |
| 2214 | 0 |
| 2215 | 0.04 |
| 2216 | 0.11 |
| 2217 | 0.11 |
| 2218 | 0.09 |
| 2219 | 0.02 |
| 2220 | -0.02 |
| 2221 | -0.06 |
| 2222 | -0.11 |
| 2223 | -0.15 |
| 2224 | -0.21 |
| 2225 | -0.19 |
| 2226 | -0.17 |
| 2227 | -0.13 |
| 2228 | -0.06 |
| 2229 | 0.02 |
| 2230 | 0.09 |
| 2231 | 0.11 |
| 2232 | 0.17 |
| 2233 | 0.17 |
| 2234 | 0.15 |
| 2235 | 0.11 |
| 2236 | -0.06 |
| 2237 | -0.21 |
| 2238 | -0.37 |
| 2239 | -0.47 |
| 2240 | -0.41 |
| 2241 | -0.26 |
| 2242 | -0.06 |
| 2243 | 0.09 |
| 2244 | 0.21 |
| 2245 | 0.24 |
| 2246 | 0.17 |
| 2247 | 0.06 |
| 2248 | -0.04 |
| 2249 | -0.13 |
| 2250 | -0.15 |
| 2251 | -0.11 |
| 2252 | 0 |
| 2253 | 0.09 |
| 2254 | 0.11 |
| 2255 | 0.09 |
| 2256 | 0 |
| 2257 | -0.11 |
| 2258 | -0.21 |
| 2259 | -0.21 |
| 2260 | -0.15 |
| 2261 | -0.09 |
| 2262 | 0 |
| 2263 | 0 |
| 2264 | -0.06 |
| 2265 | -0.15 |
| 2266 | -0.24 |
| 2267 | -0.26 |
| 2268 | -0.19 |
| 2269 | -0.11 |
| 2270 | 0 |
| 2271 | 0.04 |
| 2272 | 0.02 |
| 2273 | -0.04 |
| 2274 | -0.11 |
| 2275 | -0.17 |
| 2276 | -0.17 |
| 2277 | -0.13 |
| 2278 | -0.06 |
| 2279 | 0 |
| 2280 | 0.02 |
| 2281 | 0.04 |
| 2282 | 0.04 |
| 2283 | 0.06 |
| 2284 | 0.09 |
| 2285 | 0.06 |
| 2286 | 0.04 |
| 2287 | 0.02 |
| 2288 | -0.04 |
| 2289 | -0.06 |
| 2290 | -0.11 |
| 2291 | -0.06 |
| 2292 | -0.04 |
| 2293 | 0 |
| 2294 | 0.11 |
| 2295 | 0.19 |
| 2296 | 0.3 |
| 2297 | 0.34 |
| 2298 | 0.34 |
| 2299 | 0.3 |
| 2300 | 0.19 |
| 2301 | 0.06 |
| 2302 | -0.02 |
| 2303 | -0.09 |
| 2304 | -0.09 |
| 2305 | -0.13 |
| 2306 | -0.19 |
| 2307 | -0.26 |
| 2308 | -0.32 |
| 2309 | -0.3 |
| 2310 | -0.26 |
| 2311 | -0.13 |
| 2312 | 0 |
| 2313 | 0.11 |
| 2314 | 0.15 |
| 2315 | 0.13 |
| 2316 | 0.06 |
| 2317 | -0.02 |
| 2318 | -0.04 |
| 2319 | -0.02 |
| 2320 | 0.04 |
| 2321 | 0.09 |
| 2322 | 0.13 |
| 2323 | 0.13 |
| 2324 | 0.11 |
| 2325 | 0.06 |
| 2326 | 0.04 |
| 2327 | 0 |
| 2328 | -0.02 |
| 2329 | -0.04 |
| 2330 | -0.09 |
| 2331 | -0.09 |
| 2332 | -0.11 |
| 2333 | -0.11 |
| 2334 | -0.11 |
| 2335 | -0.11 |
| 2336 | -0.11 |
| 2337 | -0.09 |
| 2338 | -0.09 |
| 2339 | -0.04 |
| 2340 | 0 |
| 2341 | 0.04 |
| 2342 | 0.11 |
| 2343 | 0.09 |
| 2344 | 0.06 |
| 2345 | 0 |
| 2346 | -0.09 |
| 2347 | -0.11 |
| 2348 | -0.13 |
| 2349 | -0.09 |
| 2350 | -0.04 |
| 2351 | 0 |
| 2352 | -0.04 |
| 2353 | -0.13 |
| 2354 | -0.19 |
| 2355 | -0.28 |
| 2356 | -0.26 |
| 2357 | -0.19 |
| 2358 | -0.11 |
| 2359 | -0.02 |
| 2360 | -0.02 |
| 2361 | -0.04 |
| 2362 | -0.13 |
| 2363 | -0.19 |
| 2364 | -0.21 |
| 2365 | -0.17 |
| 2366 | -0.11 |
| 2367 | -0.04 |
| 2368 | -0.02 |
| 2369 | -0.02 |
| 2370 | -0.04 |
| 2371 | -0.09 |
| 2372 | -0.11 |
| 2373 | -0.09 |
| 2374 | -0.06 |
| 2375 | -0.04 |
| 2376 | -0.04 |
| 2377 | -0.02 |
| 2378 | 0 |
| 2379 | 0.02 |
| 2380 | 0.06 |
| 2381 | 0.13 |
| 2382 | 0.19 |
| 2383 | 0.24 |
| 2384 | 0.28 |
| 2385 | 0.24 |
| 2386 | 0.19 |
| 2387 | 0.11 |
| 2388 | 0 |
| 2389 | -0.09 |
| 2390 | -0.11 |
| 2391 | -0.09 |
| 2392 | 0 |
| 2393 | 0.11 |
| 2394 | 0.15 |
| 2395 | 0.11 |
| 2396 | 0.02 |
| 2397 | -0.09 |
| 2398 | -0.19 |
| 2399 | -0.24 |
| 2400 | -0.26 |
| 2401 | -0.21 |
| 2402 | -0.21 |
| 2403 | -0.26 |
| 2404 | -0.28 |
| 2405 | -0.3 |
| 2406 | -0.26 |
| 2407 | -0.19 |
| 2408 | -0.09 |
| 2409 | 0 |
| 2410 | 0.02 |
| 2411 | 0.02 |
| 2412 | 0 |
| 2413 | -0.04 |
| 2414 | -0.02 |
| 2415 | 0 |
| 2416 | 0.06 |
| 2417 | 0.13 |
| 2418 | 0.17 |
| 2419 | 0.21 |
| 2420 | 0.19 |
| 2421 | 0.17 |
| 2422 | 0.13 |
| 2423 | 0.09 |
| 2424 | 0.06 |
| 2425 | 0.04 |
| 2426 | 0.02 |
| 2427 | 0 |
| 2428 | -0.02 |
| 2429 | -0.09 |
| 2430 | -0.13 |
| 2431 | -0.21 |
| 2432 | -0.28 |
| 2433 | -0.32 |
| 2434 | -0.34 |
| 2435 | -0.32 |
| 2436 | -0.26 |
| 2437 | -0.13 |
| 2438 | 0.02 |
| 2439 | 0.13 |
| 2440 | 0.17 |
| 2441 | 0.17 |
| 2442 | 0.09 |
| 2443 | 0.04 |
| 2444 | 0.04 |
| 2445 | 0.06 |
| 2446 | 0.11 |
| 2447 | 0.13 |
| 2448 | 0.13 |
| 2449 | 0.09 |
| 2450 | 0 |
| 2451 | -0.04 |
| 2452 | -0.09 |
| 2453 | -0.11 |
| 2454 | -0.11 |
| 2455 | -0.15 |
| 2456 | -0.21 |
| 2457 | -0.28 |
| 2458 | -0.26 |
| 2459 | -0.24 |
| 2460 | -0.19 |
| 2461 | -0.15 |
| 2462 | -0.17 |
| 2463 | -0.26 |
| 2464 | -0.28 |
| 2465 | -0.3 |
| 2466 | -0.26 |
| 2467 | -0.15 |
| 2468 | -0.02 |
| 2469 | 0.09 |
| 2470 | 0.13 |
| 2471 | 0.15 |
| 2472 | 0.13 |
| 2473 | 0.11 |
| 2474 | 0.09 |
| 2475 | 0.04 |
| 2476 | -0.04 |
| 2477 | -0.15 |
| 2478 | -0.24 |
| 2479 | -0.28 |
| 2480 | -0.24 |
| 2481 | -0.11 |
| 2482 | 0.04 |
| 2483 | 0.15 |
| 2484 | 0.19 |
| 2485 | 0.13 |
| 2486 | 0 |
| 2487 | -0.13 |
| 2488 | -0.21 |
| 2489 | -0.19 |
| 2490 | -0.13 |
| 2491 | -0.02 |
| 2492 | 0.04 |
| 2493 | 0.06 |
| 2494 | 0 |
| 2495 | -0.06 |
| 2496 | -0.17 |
| 2497 | -0.26 |
| 2498 | -0.32 |
| 2499 | -0.39 |
| 2500 | -0.37 |
| 2501 | -0.34 |
| 2502 | -0.26 |
| 2503 | -0.17 |
| 2504 | -0.04 |
| 2505 | 0.02 |
| 2506 | 0.04 |
| 2507 | -0.04 |
| 2508 | -0.17 |
| 2509 | -0.32 |
| 2510 | -0.41 |
| 2511 | -0.41 |
| 2512 | -0.32 |
| 2513 | -0.21 |
| 2514 | -0.11 |
| 2515 | -0.04 |
| 2516 | -0.04 |
| 2517 | -0.04 |
| 2518 | -0.04 |
| 2519 | -0.06 |
| 2520 | -0.09 |
| 2521 | -0.11 |
| 2522 | -0.11 |
| 2523 | -0.11 |
| 2524 | -0.06 |
| 2525 | 0.02 |
| 2526 | 0.04 |
| 2527 | 0.06 |
| 2528 | 0 |
| 2529 | -0.02 |
| 2530 | -0.06 |
| 2531 | -0.06 |
| 2532 | -0.02 |
| 2533 | 0.02 |
| 2534 | 0.09 |
| 2535 | 0.09 |
| 2536 | 0.09 |
| 2537 | 0.04 |
| 2538 | 0 |
| 2539 | 0 |
| 2540 | 0.04 |
| 2541 | 0.09 |
| 2542 | 0.15 |
| 2543 | 0.17 |
| 2544 | 0.15 |
| 2545 | 0.13 |
| 2546 | 0.09 |
| 2547 | 0.04 |
| 2548 | 0.02 |
| 2549 | 0 |
| 2550 | 0.02 |
| 2551 | 0.04 |
| 2552 | 0.09 |
| 2553 | 0.15 |
| 2554 | 0.21 |
| 2555 | 0.28 |
| 2556 | 0.28 |
| 2557 | 0.24 |
| 2558 | 0.15 |
| 2559 | 0.09 |
| 2560 | 0 |
| 2561 | 0.02 |
| 2562 | 0.06 |
| 2563 | 0.09 |
| 2564 | 0.09 |
| 2565 | 0.02 |
| 2566 | -0.11 |
| 2567 | -0.19 |
| 2568 | -0.26 |
| 2569 | -0.24 |
| 2570 | -0.15 |
| 2571 | -0.02 |
| 2572 | 0.06 |
| 2573 | 0.06 |
| 2574 | 0.04 |
| 2575 | 0 |
| 2576 | -0.06 |
| 2577 | -0.02 |
| 2578 | 0.06 |
| 2579 | 0.17 |
| 2580 | 0.19 |
| 2581 | 0.15 |
| 2582 | 0.02 |
| 2583 | -0.15 |
| 2584 | -0.26 |
| 2585 | -0.32 |
| 2586 | -0.26 |
| 2587 | -0.13 |
| 2588 | -0.04 |
| 2589 | 0.02 |
| 2590 | 0.02 |
| 2591 | -0.02 |
| 2592 | -0.06 |
| 2593 | -0.09 |
| 2594 | -0.09 |
| 2595 | -0.11 |
| 2596 | -0.15 |
| 2597 | -0.19 |
| 2598 | -0.19 |
| 2599 | -0.15 |
| 2600 | -0.06 |
| 2601 | 0.06 |
| 2602 | 0.17 |
| 2603 | 0.24 |
| 2604 | 0.24 |
| 2605 | 0.19 |
| 2606 | 0.13 |
| 2607 | -0.02 |
| 2608 | -0.06 |
| 2609 | -0.11 |
| 2610 | -0.06 |
| 2611 | 0.06 |
| 2612 | 0.24 |
| 2613 | 0.41 |
| 2614 | 0.52 |
| 2615 | 0.56 |
| 2616 | 0.47 |
| 2617 | 0.3 |
| 2618 | 0.11 |
| 2619 | -0.02 |
| 2620 | -0.09 |
| 2621 | -0.04 |
| 2622 | 0.06 |
| 2623 | 0.15 |
| 2624 | 0.21 |
| 2625 | 0.26 |
| 2626 | 0.24 |
| 2627 | 0.17 |
| 2628 | 0.15 |
| 2629 | 0.15 |
| 2630 | 0.15 |
| 2631 | 0.15 |
| 2632 | 0.15 |
| 2633 | 0.11 |
| 2634 | 0.09 |
| 2635 | 0.06 |
| 2636 | 0.09 |
| 2637 | 0.15 |
| 2638 | 0.19 |
| 2639 | 0.26 |
| 2640 | 0.28 |
| 2641 | 0.26 |
| 2642 | 0.21 |
| 2643 | 0.19 |
| 2644 | 0.21 |
| 2645 | 0.24 |
| 2646 | 0.21 |
| 2647 | 0.19 |
| 2648 | 0.17 |
| 2649 | 0.15 |
| 2650 | 0.13 |
| 2651 | 0.11 |
| 2652 | 0.04 |
| 2653 | -0.04 |
| 2654 | -0.17 |
| 2655 | -0.3 |
| 2656 | -0.37 |
| 2657 | -0.34 |
| 2658 | -0.19 |
| 2659 | 0 |
| 2660 | 0.15 |
| 2661 | 0.24 |
| 2662 | 0.19 |
| 2663 | 0.09 |
| 2664 | -0.06 |
| 2665 | -0.21 |
| 2666 | -0.34 |
| 2667 | -0.41 |
| 2668 | -0.41 |
| 2669 | -0.34 |
| 2670 | -0.21 |
| 2671 | -0.06 |
| 2672 | 0.09 |
| 2673 | 0.21 |
| 2674 | 0.3 |
| 2675 | 0.3 |
| 2676 | 0.21 |
| 2677 | 0.15 |
| 2678 | 0.04 |
| 2679 | -0.02 |
| 2680 | -0.02 |
| 2681 | 0.02 |
| 2682 | 0.09 |
| 2683 | 0.11 |
| 2684 | 0.09 |
| 2685 | 0 |
| 2686 | -0.04 |
| 2687 | -0.11 |
| 2688 | -0.11 |
| 2689 | -0.02 |
| 2690 | 0.06 |
| 2691 | 0.15 |
| 2692 | 0.19 |
| 2693 | 0.19 |
| 2694 | 0.17 |
| 2695 | 0.11 |
| 2696 | 0.06 |
| 2697 | 0 |
| 2698 | -0.02 |
| 2699 | -0.09 |
| 2700 | -0.09 |
| 2701 | -0.04 |
| 2702 | 0.04 |
| 2703 | 0.15 |
| 2704 | 0.24 |
| 2705 | 0.24 |
| 2706 | 0.19 |
| 2707 | 0.13 |
| 2708 | 0.09 |
| 2709 | 0.11 |
| 2710 | 0.13 |
| 2711 | 0.15 |
| 2712 | 0.13 |
| 2713 | 0.04 |
| 2714 | -0.02 |
| 2715 | 0 |
| 2716 | 0.04 |
| 2717 | 0.17 |
| 2718 | 0.28 |
| 2719 | 0.3 |
| 2720 | 0.21 |
| 2721 | 0.06 |
| 2722 | -0.13 |
| 2723 | -0.21 |
| 2724 | -0.24 |
| 2725 | -0.11 |
| 2726 | 0.06 |
| 2727 | 0.21 |
| 2728 | 0.34 |
| 2729 | 0.37 |
| 2730 | 0.28 |
| 2731 | 0.17 |
| 2732 | 0.04 |
| 2733 | -0.09 |
| 2734 | -0.15 |
| 2735 | -0.21 |
| 2736 | -0.24 |
| 2737 | -0.24 |
| 2738 | -0.24 |
| 2739 | -0.17 |
| 2740 | -0.06 |
| 2741 | 0.06 |
| 2742 | 0.17 |
| 2743 | 0.28 |
| 2744 | 0.28 |
| 2745 | 0.24 |
| 2746 | 0.11 |
| 2747 | -0.02 |
| 2748 | -0.09 |
| 2749 | -0.04 |
| 2750 | 0.02 |
| 2751 | 0.13 |
| 2752 | 0.17 |
| 2753 | 0.17 |
| 2754 | 0.09 |
| 2755 | -0.02 |
| 2756 | -0.11 |
| 2757 | -0.15 |
| 2758 | -0.15 |
| 2759 | -0.11 |
| 2760 | -0.04 |
| 2761 | 0.02 |
| 2762 | 0.09 |
| 2763 | 0.15 |
| 2764 | 0.15 |
| 2765 | 0.13 |
| 2766 | 0.04 |
| 2767 | -0.06 |
| 2768 | -0.15 |
| 2769 | -0.21 |
| 2770 | -0.28 |
| 2771 | -0.3 |
| 2772 | -0.34 |
| 2773 | -0.3 |
| 2774 | -0.28 |
| 2775 | -0.17 |
| 2776 | -0.06 |
| 2777 | 0.04 |
| 2778 | 0.09 |
| 2779 | 0.06 |
| 2780 | -0.02 |
| 2781 | -0.17 |
| 2782 | -0.28 |
| 2783 | -0.37 |
| 2784 | -0.37 |
| 2785 | -0.34 |
| 2786 | -0.32 |
| 2787 | -0.28 |
| 2788 | -0.28 |
| 2789 | -0.21 |
| 2790 | -0.09 |
| 2791 | 0.09 |
| 2792 | 0.26 |
| 2793 | 0.41 |
| 2794 | 0.49 |
| 2795 | 0.52 |
| 2796 | 0.39 |
| 2797 | 0.26 |
| 2798 | 0.09 |
| 2799 | -0.02 |
| 2800 | -0.13 |
| 2801 | -0.11 |
| 2802 | -0.09 |
| 2803 | -0.02 |
| 2804 | 0.04 |
| 2805 | 0.11 |
| 2806 | 0.13 |
| 2807 | 0.15 |
| 2808 | 0.19 |
| 2809 | 0.19 |
| 2810 | 0.26 |
| 2811 | 0.26 |
| 2812 | 0.26 |
| 2813 | 0.26 |
| 2814 | 0.21 |
| 2815 | 0.19 |
| 2816 | 0.19 |
| 2817 | 0.17 |
| 2818 | 0.19 |
| 2819 | 0.21 |
| 2820 | 0.17 |
| 2821 | 0.11 |
| 2822 | 0.06 |
| 2823 | 0.02 |
| 2824 | 0 |
| 2825 | 0.04 |
| 2826 | 0.15 |
| 2827 | 0.21 |
| 2828 | 0.26 |
| 2829 | 0.21 |
| 2830 | 0.13 |
| 2831 | 0.04 |
| 2832 | -0.06 |
| 2833 | -0.17 |
| 2834 | -0.21 |
| 2835 | -0.24 |
| 2836 | -0.21 |
| 2837 | -0.11 |
| 2838 | 0.04 |
| 2839 | 0.19 |
| 2840 | 0.26 |
| 2841 | 0.3 |
| 2842 | 0.28 |
| 2843 | 0.19 |
| 2844 | 0.11 |
| 2845 | 0 |
| 2846 | -0.09 |
| 2847 | -0.15 |
| 2848 | -0.15 |
| 2849 | -0.06 |
| 2850 | 0.04 |
| 2851 | 0.17 |
| 2852 | 0.24 |
| 2853 | 0.21 |
| 2854 | 0.13 |
| 2855 | -0.02 |
| 2856 | -0.13 |
| 2857 | -0.19 |
| 2858 | -0.19 |
| 2859 | -0.15 |
| 2860 | -0.13 |
| 2861 | -0.11 |
| 2862 | -0.11 |
| 2863 | -0.06 |
| 2864 | -0.04 |
| 2865 | -0.04 |
| 2866 | -0.04 |
| 2867 | -0.11 |
| 2868 | -0.17 |
| 2869 | -0.21 |
| 2870 | -0.26 |
| 2871 | -0.21 |
| 2872 | -0.17 |
| 2873 | -0.11 |
| 2874 | -0.06 |
| 2875 | 0.02 |
| 2876 | 0.04 |
| 2877 | 0.04 |
| 2878 | 0 |
| 2879 | -0.06 |
| 2880 | -0.15 |
| 2881 | -0.21 |
| 2882 | -0.24 |
| 2883 | -0.19 |
| 2884 | -0.13 |
| 2885 | -0.02 |
| 2886 | 0.02 |
| 2887 | 0.06 |
| 2888 | 0.06 |
| 2889 | 0.04 |
| 2890 | 0.02 |
| 2891 | 0 |
| 2892 | 0 |
| 2893 | -0.02 |
| 2894 | 0 |
| 2895 | 0.02 |
| 2896 | 0.02 |
| 2897 | 0.02 |
| 2898 | 0 |
| 2899 | 0 |
| 2900 | -0.02 |
| 2901 | -0.02 |
| 2902 | -0.02 |
| 2903 | -0.06 |
| 2904 | -0.09 |
| 2905 | -0.15 |
| 2906 | -0.21 |
| 2907 | -0.24 |
| 2908 | -0.19 |
| 2909 | -0.13 |
| 2910 | -0.02 |
| 2911 | 0.04 |
| 2912 | 0.09 |
| 2913 | 0.04 |
| 2914 | 0.02 |
| 2915 | -0.06 |
| 2916 | -0.09 |
| 2917 | -0.13 |
| 2918 | -0.17 |
| 2919 | -0.17 |
| 2920 | -0.15 |
| 2921 | -0.09 |
| 2922 | -0.04 |
| 2923 | -0.02 |
| 2924 | 0.02 |
| 2925 | 0.04 |
| 2926 | 0 |
| 2927 | 0 |
| 2928 | 0 |
| 2929 | 0 |
| 2930 | 0.02 |
| 2931 | 0 |
| 2932 | -0.06 |
| 2933 | -0.17 |
| 2934 | -0.3 |
| 2935 | -0.39 |
| 2936 | -0.41 |
| 2937 | -0.3 |
| 2938 | -0.13 |
| 2939 | 0.02 |
| 2940 | 0.13 |
| 2941 | 0.09 |
| 2942 | -0.04 |
| 2943 | -0.15 |
| 2944 | -0.19 |
| 2945 | -0.15 |
| 2946 | -0.04 |
| 2947 | 0.11 |
| 2948 | 0.21 |
| 2949 | 0.26 |
| 2950 | 0.21 |
| 2951 | 0.17 |
| 2952 | 0.11 |
| 2953 | 0.09 |
| 2954 | 0.02 |
| 2955 | -0.02 |
| 2956 | -0.06 |
| 2957 | -0.15 |
| 2958 | -0.19 |
| 2959 | -0.19 |
| 2960 | -0.15 |
| 2961 | -0.11 |
| 2962 | -0.06 |
| 2963 | -0.02 |
| 2964 | -0.04 |
| 2965 | -0.11 |
| 2966 | -0.19 |
| 2967 | -0.3 |
| 2968 | -0.39 |
| 2969 | -0.45 |
| 2970 | -0.43 |
| 2971 | -0.41 |
| 2972 | -0.3 |
| 2973 | -0.21 |
| 2974 | -0.15 |
| 2975 | -0.17 |
| 2976 | -0.21 |
| 2977 | -0.26 |
| 2978 | -0.24 |
| 2979 | -0.17 |
| 2980 | -0.04 |
| 2981 | 0.06 |
| 2982 | 0.11 |
| 2983 | 0.13 |
| 2984 | 0.06 |
| 2985 | -0.02 |
| 2986 | -0.09 |
| 2987 | -0.17 |
| 2988 | -0.19 |
| 2989 | -0.21 |
| 2990 | -0.21 |
| 2991 | -0.17 |
| 2992 | -0.09 |
| 2993 | -0.02 |
| 2994 | 0.06 |
| 2995 | 0.17 |
| 2996 | 0.17 |
| 2997 | 0.17 |
| 2998 | 0.11 |
| 2999 | 0.06 |
| 3000 | 0.02 |
| 3001 | 0.02 |
| 3002 | 0.02 |
| 3003 | 0.04 |
| 3004 | 0.04 |
| 3005 | 0.02 |
| 3006 | -0.02 |
| 3007 | -0.06 |
| 3008 | -0.13 |
| 3009 | -0.15 |
| 3010 | -0.11 |
| 3011 | -0.11 |
| 3012 | -0.04 |
| 3013 | 0 |
| 3014 | 0 |
| 3015 | 0 |
| 3016 | -0.04 |
| 3017 | -0.04 |
| 3018 | 0.02 |
| 3019 | 0.09 |
| 3020 | 0.15 |
| 3021 | 0.13 |
| 3022 | 0.04 |
| 3023 | -0.06 |
| 3024 | -0.15 |
| 3025 | -0.11 |
| 3026 | -0.06 |
| 3027 | 0.02 |
| 3028 | 0.06 |
| 3029 | 0.02 |
| 3030 | -0.11 |
| 3031 | -0.26 |
| 3032 | -0.39 |
| 3033 | -0.43 |
| 3034 | -0.37 |
| 3035 | -0.28 |
| 3036 | -0.15 |
| 3037 | -0.04 |
| 3038 | 0.02 |
| 3039 | 0.02 |
| 3040 | -0.04 |
| 3041 | -0.13 |
| 3042 | -0.26 |
| 3043 | -0.32 |
| 3044 | -0.39 |
| 3045 | -0.41 |
| 3046 | -0.37 |
| 3047 | -0.32 |
| 3048 | -0.21 |
| 3049 | -0.17 |
| 3050 | -0.17 |
| 3051 | -0.17 |
| 3052 | -0.17 |
| 3053 | -0.15 |
| 3054 | -0.11 |
| 3055 | 0.02 |
| 3056 | 0.09 |
| 3057 | 0.15 |
| 3058 | 0.17 |
| 3059 | 0.09 |
| 3060 | 0.04 |
| 3061 | 0 |
| 3062 | -0.04 |
| 3063 | -0.02 |
| 3064 | -0.02 |
| 3065 | 0 |
| 3066 | -0.02 |
| 3067 | -0.06 |
| 3068 | -0.11 |
| 3069 | -0.11 |
| 3070 | -0.06 |
| 3071 | -0.04 |
| 3072 | 0 |
| 3073 | 0.06 |
| 3074 | 0.11 |
| 3075 | 0.13 |
| 3076 | 0.11 |
| 3077 | 0.09 |
| 3078 | 0 |
| 3079 | -0.09 |
| 3080 | -0.21 |
| 3081 | -0.34 |
| 3082 | -0.39 |
| 3083 | -0.41 |
| 3084 | -0.32 |
| 3085 | -0.24 |
| 3086 | -0.15 |
| 3087 | -0.06 |
| 3088 | -0.06 |
| 3089 | -0.04 |
| 3090 | -0.04 |
| 3091 | -0.02 |
| 3092 | 0.04 |
| 3093 | 0.09 |
| 3094 | 0.09 |
| 3095 | 0.09 |
| 3096 | 0 |
| 3097 | -0.09 |
| 3098 | -0.19 |
| 3099 | -0.26 |
| 3100 | -0.28 |
| 3101 | -0.28 |
| 3102 | -0.28 |
| 3103 | -0.28 |
| 3104 | -0.26 |
| 3105 | -0.24 |
| 3106 | -0.21 |
| 3107 | -0.15 |
| 3108 | -0.11 |
| 3109 | -0.06 |
| 3110 | -0.06 |
| 3111 | -0.04 |
| 3112 | -0.04 |
| 3113 | -0.04 |
| 3114 | -0.04 |
| 3115 | 0 |
| 3116 | 0 |
| 3117 | 0 |
| 3118 | -0.02 |
| 3119 | -0.09 |
| 3120 | -0.11 |
| 3121 | -0.11 |
| 3122 | -0.09 |
| 3123 | -0.06 |
| 3124 | -0.02 |
| 3125 | 0.02 |
| 3126 | 0.06 |
| 3127 | 0.13 |
| 3128 | 0.19 |
| 3129 | 0.24 |
| 3130 | 0.26 |
| 3131 | 0.21 |
| 3132 | 0.13 |
| 3133 | -0.02 |
| 3134 | -0.13 |
| 3135 | -0.21 |
| 3136 | -0.24 |
| 3137 | -0.21 |
| 3138 | -0.19 |
| 3139 | -0.15 |
| 3140 | -0.13 |
| 3141 | -0.11 |
| 3142 | -0.09 |
| 3143 | -0.06 |
| 3144 | -0.04 |
| 3145 | -0.06 |
| 3146 | -0.11 |
| 3147 | -0.17 |
| 3148 | -0.24 |
| 3149 | -0.28 |
| 3150 | -0.21 |
| 3151 | -0.13 |
| 3152 | 0.02 |
| 3153 | 0.15 |
| 3154 | 0.19 |
| 3155 | 0.17 |
| 3156 | 0.11 |
| 3157 | 0.06 |
| 3158 | 0.02 |
| 3159 | 0.02 |
| 3160 | 0.11 |
| 3161 | 0.15 |
| 3162 | 0.19 |
| 3163 | 0.21 |
| 3164 | 0.11 |
| 3165 | 0.02 |
| 3166 | -0.13 |
| 3167 | -0.24 |
| 3168 | -0.26 |
| 3169 | -0.24 |
| 3170 | -0.19 |
| 3171 | -0.11 |
| 3172 | -0.04 |
| 3173 | 0 |
| 3174 | 0 |
| 3175 | 0.02 |
| 3176 | 0.06 |
| 3177 | 0.13 |
| 3178 | 0.21 |
| 3179 | 0.3 |
| 3180 | 0.32 |
| 3181 | 0.3 |
| 3182 | 0.21 |
| 3183 | 0.06 |
| 3184 | -0.06 |
| 3185 | -0.17 |
| 3186 | -0.26 |
| 3187 | -0.24 |
| 3188 | -0.21 |
| 3189 | -0.11 |
| 3190 | 0.02 |
| 3191 | 0.09 |
| 3192 | 0.15 |
| 3193 | 0.11 |
| 3194 | 0.06 |
| 3195 | 0 |
| 3196 | -0.09 |
| 3197 | -0.09 |
| 3198 | -0.04 |
| 3199 | 0 |
| 3200 | 0.04 |
| 3201 | 0.06 |
| 3202 | 0.04 |
| 3203 | 0 |
| 3204 | -0.06 |
| 3205 | -0.15 |
| 3206 | -0.28 |
| 3207 | -0.34 |
| 3208 | -0.34 |
| 3209 | -0.24 |
| 3210 | -0.11 |
| 3211 | 0.06 |
| 3212 | 0.19 |
| 3213 | 0.26 |
| 3214 | 0.21 |
| 3215 | 0.11 |
| 3216 | 0 |
| 3217 | -0.06 |
| 3218 | -0.09 |
| 3219 | -0.02 |
| 3220 | 0.11 |
| 3221 | 0.19 |
| 3222 | 0.21 |
| 3223 | 0.19 |
| 3224 | 0.11 |
| 3225 | 0 |
| 3226 | -0.09 |
| 3227 | -0.17 |
| 3228 | -0.19 |
| 3229 | -0.21 |
| 3230 | -0.21 |
| 3231 | -0.19 |
| 3232 | -0.17 |
| 3233 | -0.13 |
| 3234 | -0.11 |
| 3235 | -0.04 |
| 3236 | 0.02 |
| 3237 | 0.06 |
| 3238 | 0.11 |
| 3239 | 0.13 |
| 3240 | 0.15 |
| 3241 | 0.15 |
| 3242 | 0.13 |
| 3243 | 0.09 |
| 3244 | 0.02 |
| 3245 | -0.04 |
| 3246 | -0.13 |
| 3247 | -0.15 |
| 3248 | -0.17 |
| 3249 | -0.15 |
| 3250 | -0.15 |
| 3251 | -0.13 |
| 3252 | -0.09 |
| 3253 | -0.11 |
| 3254 | -0.09 |
| 3255 | -0.11 |
| 3256 | -0.15 |
| 3257 | -0.19 |
| 3258 | -0.24 |
| 3259 | -0.21 |
| 3260 | -0.15 |
| 3261 | 0 |
| 3262 | 0.15 |
| 3263 | 0.24 |
| 3264 | 0.3 |
| 3265 | 0.28 |
| 3266 | 0.24 |
| 3267 | 0.26 |
| 3268 | 0.24 |
| 3269 | 0.26 |
| 3270 | 0.21 |
| 3271 | 0.11 |
| 3272 | 0 |
| 3273 | -0.13 |
| 3274 | -0.19 |
| 3275 | -0.26 |
| 3276 | -0.24 |
| 3277 | -0.24 |
| 3278 | -0.24 |
| 3279 | -0.24 |
| 3280 | -0.17 |
| 3281 | -0.09 |
| 3282 | 0.09 |
| 3283 | 0.21 |
| 3284 | 0.32 |
| 3285 | 0.34 |
| 3286 | 0.3 |
| 3287 | 0.19 |
| 3288 | 0.13 |
| 3289 | 0.13 |
| 3290 | 0.13 |
| 3291 | 0.17 |
| 3292 | 0.19 |
| 3293 | 0.21 |
| 3294 | 0.19 |
| 3295 | 0.15 |
| 3296 | 0.09 |
| 3297 | 0.04 |
| 3298 | 0.04 |
| 3299 | 0.11 |
| 3300 | 0.17 |
| 3301 | 0.26 |
| 3302 | 0.32 |
| 3303 | 0.32 |
| 3304 | 0.28 |
| 3305 | 0.19 |
| 3306 | 0.11 |
| 3307 | 0.02 |
| 3308 | 0 |
| 3309 | 0 |
| 3310 | -0.02 |
| 3311 | -0.04 |
| 3312 | -0.13 |
| 3313 | -0.17 |
| 3314 | -0.24 |
| 3315 | -0.21 |
| 3316 | -0.13 |
| 3317 | -0.04 |
| 3318 | 0.06 |
| 3319 | 0.09 |
| 3320 | 0.09 |
| 3321 | 0.02 |
| 3322 | -0.09 |
| 3323 | -0.19 |
| 3324 | -0.28 |
| 3325 | -0.3 |
| 3326 | -0.28 |
| 3327 | -0.21 |
| 3328 | -0.13 |
| 3329 | -0.06 |
| 3330 | -0.02 |
| 3331 | 0 |
| 3332 | -0.02 |
| 3333 | -0.04 |
| 3334 | -0.04 |
| 3335 | -0.02 |
| 3336 | -0.02 |
| 3337 | -0.09 |
| 3338 | -0.15 |
| 3339 | -0.26 |
| 3340 | -0.3 |
| 3341 | -0.3 |
| 3342 | -0.24 |
| 3343 | -0.15 |
| 3344 | 0 |
| 3345 | 0.09 |
| 3346 | 0.17 |
| 3347 | 0.21 |
| 3348 | 0.28 |
| 3349 | 0.3 |
| 3350 | 0.32 |
| 3351 | 0.34 |
| 3352 | 0.34 |
| 3353 | 0.34 |
| 3354 | 0.37 |
| 3355 | 0.37 |
| 3356 | 0.3 |
| 3357 | 0.26 |
| 3358 | 0.17 |
| 3359 | 0.04 |
| 3360 | -0.04 |
| 3361 | -0.09 |
| 3362 | -0.11 |
| 3363 | -0.04 |
| 3364 | 0 |
| 3365 | 0 |
| 3366 | 0 |
| 3367 | -0.04 |
| 3368 | -0.02 |
| 3369 | 0 |
| 3370 | 0.09 |
| 3371 | 0.13 |
| 3372 | 0.15 |
| 3373 | 0.09 |
| 3374 | -0.02 |
| 3375 | -0.15 |
| 3376 | -0.21 |
| 3377 | -0.26 |
| 3378 | -0.21 |
| 3379 | -0.17 |
| 3380 | -0.13 |
| 3381 | -0.17 |
| 3382 | -0.19 |
| 3383 | -0.19 |
| 3384 | -0.17 |
| 3385 | -0.13 |
| 3386 | -0.04 |
| 3387 | 0.06 |
| 3388 | 0.15 |
| 3389 | 0.11 |
| 3390 | 0.02 |
| 3391 | -0.15 |
| 3392 | -0.28 |
| 3393 | -0.39 |
| 3394 | -0.39 |
| 3395 | -0.32 |
| 3396 | -0.13 |
| 3397 | 0.06 |
| 3398 | 0.26 |
| 3399 | 0.34 |
| 3400 | 0.32 |
| 3401 | 0.19 |
| 3402 | 0.06 |
| 3403 | -0.06 |
| 3404 | -0.15 |
| 3405 | -0.11 |
| 3406 | -0.02 |
| 3407 | 0.09 |
| 3408 | 0.17 |
| 3409 | 0.21 |
| 3410 | 0.19 |
| 3411 | 0.13 |
| 3412 | 0.11 |
| 3413 | 0.06 |
| 3414 | 0.09 |
| 3415 | 0.09 |
| 3416 | 0.11 |
| 3417 | 0.15 |
| 3418 | 0.21 |
| 3419 | 0.21 |
| 3420 | 0.21 |
| 3421 | 0.21 |
| 3422 | 0.17 |
| 3423 | 0.11 |
| 3424 | 0.09 |
| 3425 | 0.06 |
| 3426 | 0.09 |
| 3427 | 0.11 |
| 3428 | 0.13 |
| 3429 | 0.11 |
| 3430 | 0.11 |
| 3431 | 0.13 |
| 3432 | 0.19 |
| 3433 | 0.28 |
| 3434 | 0.34 |
| 3435 | 0.34 |
| 3436 | 0.28 |
| 3437 | 0.13 |
| 3438 | -0.02 |
| 3439 | -0.13 |
| 3440 | -0.17 |
| 3441 | -0.15 |
| 3442 | -0.06 |
| 3443 | 0.04 |
| 3444 | 0.13 |
| 3445 | 0.17 |
| 3446 | 0.15 |
| 3447 | 0.11 |
| 3448 | 0.04 |
| 3449 | 0 |
| 3450 | -0.04 |
| 3451 | -0.06 |
| 3452 | -0.09 |
| 3453 | -0.09 |
| 3454 | -0.13 |
| 3455 | -0.15 |
| 3456 | -0.15 |
| 3457 | -0.17 |
| 3458 | -0.15 |
| 3459 | -0.04 |
| 3460 | 0.02 |
| 3461 | 0.11 |
| 3462 | 0.17 |
| 3463 | 0.11 |
| 3464 | 0.04 |
| 3465 | -0.04 |
| 3466 | -0.09 |
| 3467 | -0.09 |
| 3468 | 0 |
| 3469 | 0.09 |
| 3470 | 0.21 |
| 3471 | 0.24 |
| 3472 | 0.26 |
| 3473 | 0.24 |
| 3474 | 0.24 |
| 3475 | 0.21 |
| 3476 | 0.21 |
| 3477 | 0.15 |
| 3478 | 0.09 |
| 3479 | -0.02 |
| 3480 | -0.11 |
| 3481 | -0.13 |
| 3482 | -0.06 |
| 3483 | 0.09 |
| 3484 | 0.24 |
| 3485 | 0.3 |
| 3486 | 0.32 |
| 3487 | 0.19 |
| 3488 | -0.02 |
| 3489 | -0.26 |
| 3490 | -0.43 |
| 3491 | -0.49 |
| 3492 | -0.41 |
| 3493 | -0.21 |
| 3494 | 0 |
| 3495 | 0.19 |
| 3496 | 0.32 |
| 3497 | 0.3 |
| 3498 | 0.26 |
| 3499 | 0.24 |
| 3500 | 0.24 |
| 3501 | 0.24 |
| 3502 | 0.3 |
| 3503 | 0.3 |
| 3504 | 0.28 |
| 3505 | 0.21 |
| 3506 | 0.15 |
| 3507 | 0.11 |
| 3508 | 0.09 |
| 3509 | 0.09 |
| 3510 | 0.09 |
| 3511 | 0.06 |
| 3512 | 0.06 |
| 3513 | 0.04 |
| 3514 | 0.04 |
| 3515 | 0.04 |
| 3516 | 0.04 |
| 3517 | 0.02 |
| 3518 | 0 |
| 3519 | -0.04 |
| 3520 | -0.04 |
| 3521 | -0.02 |
| 3522 | 0.02 |
| 3523 | 0.06 |
| 3524 | 0.11 |
| 3525 | 0.11 |
| 3526 | 0.15 |
| 3527 | 0.17 |
| 3528 | 0.24 |
| 3529 | 0.28 |
| 3530 | 0.28 |
| 3531 | 0.24 |
| 3532 | 0.21 |
| 3533 | 0.11 |
| 3534 | 0 |
| 3535 | -0.11 |
| 3536 | -0.17 |
| 3537 | -0.21 |
| 3538 | -0.19 |
| 3539 | -0.13 |
| 3540 | -0.06 |
| 3541 | 0 |
| 3542 | 0.04 |
| 3543 | 0.06 |
| 3544 | 0.09 |
| 3545 | 0.06 |
| 3546 | 0.04 |
| 3547 | 0.04 |
| 3548 | 0.02 |
| 3549 | 0 |
| 3550 | -0.02 |
| 3551 | -0.11 |
| 3552 | -0.19 |
| 3553 | -0.24 |
| 3554 | -0.24 |
| 3555 | -0.19 |
| 3556 | -0.11 |
| 3557 | -0.04 |
| 3558 | 0.02 |
| 3559 | 0 |
| 3560 | -0.04 |
| 3561 | -0.15 |
| 3562 | -0.21 |
| 3563 | -0.24 |
| 3564 | -0.24 |
| 3565 | -0.19 |
| 3566 | -0.15 |
| 3567 | -0.09 |
| 3568 | 0.02 |
| 3569 | 0.09 |
| 3570 | 0.15 |
| 3571 | 0.24 |
| 3572 | 0.26 |
| 3573 | 0.28 |
| 3574 | 0.24 |
| 3575 | 0.24 |
| 3576 | 0.21 |
| 3577 | 0.21 |
| 3578 | 0.19 |
| 3579 | 0.17 |
| 3580 | 0.13 |
| 3581 | 0.11 |
| 3582 | 0.06 |
| 3583 | 0.04 |
| 3584 | -0.02 |
| 3585 | -0.09 |
| 3586 | -0.11 |
| 3587 | -0.09 |
| 3588 | -0.04 |
| 3589 | 0.02 |
| 3590 | 0.06 |
| 3591 | 0.04 |
| 3592 | -0.02 |
| 3593 | -0.11 |
| 3594 | -0.15 |
| 3595 | -0.15 |
| 3596 | -0.15 |
| 3597 | -0.15 |
| 3598 | -0.13 |
| 3599 | -0.06 |
| 3600 | 0.02 |
| 3601 | 0.13 |
| 3602 | 0.21 |
| 3603 | 0.28 |
| 3604 | 0.21 |
| 3605 | 0.09 |
| 3606 | -0.09 |
| 3607 | -0.28 |
| 3608 | -0.43 |
| 3609 | -0.52 |
| 3610 | -0.49 |
| 3611 | -0.43 |
| 3612 | -0.32 |
| 3613 | -0.19 |
| 3614 | -0.09 |
| 3615 | 0 |
| 3616 | 0.06 |
| 3617 | 0.06 |
| 3618 | 0.02 |
| 3619 | -0.04 |
| 3620 | -0.11 |
| 3621 | -0.13 |
| 3622 | -0.15 |
| 3623 | -0.13 |
| 3624 | -0.04 |
| 3625 | 0.04 |
| 3626 | 0.09 |
| 3627 | 0.09 |
| 3628 | -0.02 |
| 3629 | -0.11 |
| 3630 | -0.21 |
| 3631 | -0.28 |
| 3632 | -0.26 |
| 3633 | -0.21 |
| 3634 | -0.11 |
| 3635 | -0.06 |
| 3636 | -0.09 |
| 3637 | -0.09 |
| 3638 | -0.13 |
| 3639 | -0.13 |
| 3640 | -0.06 |
| 3641 | 0 |
| 3642 | 0.11 |
| 3643 | 0.15 |
| 3644 | 0.24 |
| 3645 | 0.28 |
| 3646 | 0.3 |
| 3647 | 0.32 |
| 3648 | 0.34 |
| 3649 | 0.34 |
| 3650 | 0.32 |
| 3651 | 0.24 |
| 3652 | 0.13 |
| 3653 | 0.04 |
| 3654 | -0.02 |
| 3655 | 0 |
| 3656 | 0.06 |
| 3657 | 0.11 |
| 3658 | 0.06 |
| 3659 | 0 |
| 3660 | -0.13 |
| 3661 | -0.24 |
| 3662 | -0.28 |
| 3663 | -0.21 |
| 3664 | -0.06 |
| 3665 | 0.06 |
| 3666 | 0.15 |
| 3667 | 0.13 |
| 3668 | 0.02 |
| 3669 | -0.09 |
| 3670 | -0.15 |
| 3671 | -0.17 |
| 3672 | -0.13 |
| 3673 | -0.06 |
| 3674 | 0.02 |
| 3675 | 0.02 |
| 3676 | -0.02 |
| 3677 | -0.06 |
| 3678 | -0.11 |
| 3679 | -0.13 |
| 3680 | -0.11 |
| 3681 | -0.04 |
| 3682 | -0.02 |
| 3683 | 0 |
| 3684 | 0 |
| 3685 | -0.02 |
| 3686 | -0.04 |
| 3687 | -0.06 |
| 3688 | -0.11 |
| 3689 | -0.15 |
| 3690 | -0.19 |
| 3691 | -0.24 |
| 3692 | -0.26 |
| 3693 | -0.21 |
| 3694 | -0.17 |
| 3695 | -0.11 |
| 3696 | -0.11 |
| 3697 | -0.15 |
| 3698 | -0.21 |
| 3699 | -0.32 |
| 3700 | -0.34 |
| 3701 | -0.3 |
| 3702 | -0.15 |
| 3703 | 0.02 |
| 3704 | 0.15 |
| 3705 | 0.24 |
| 3706 | 0.21 |
| 3707 | 0.09 |
| 3708 | -0.06 |
| 3709 | -0.21 |
| 3710 | -0.26 |
| 3711 | -0.24 |
| 3712 | -0.11 |
| 3713 | 0.04 |
| 3714 | 0.13 |
| 3715 | 0.15 |
| 3716 | 0.06 |
| 3717 | -0.06 |
| 3718 | -0.24 |
| 3719 | -0.3 |
| 3720 | -0.28 |
| 3721 | -0.17 |
| 3722 | 0 |
| 3723 | 0.13 |
| 3724 | 0.26 |
| 3725 | 0.26 |
| 3726 | 0.21 |
| 3727 | 0.09 |
| 3728 | -0.06 |
| 3729 | -0.19 |
| 3730 | -0.26 |
| 3731 | -0.26 |
| 3732 | -0.15 |
| 3733 | -0.04 |
| 3734 | 0.06 |
| 3735 | 0.15 |
| 3736 | 0.17 |
| 3737 | 0.17 |
| 3738 | 0.17 |
| 3739 | 0.17 |
| 3740 | 0.21 |
| 3741 | 0.24 |
| 3742 | 0.28 |
| 3743 | 0.24 |
| 3744 | 0.13 |
| 3745 | 0 |
| 3746 | -0.09 |
| 3747 | -0.17 |
| 3748 | -0.17 |
| 3749 | -0.11 |
| 3750 | -0.04 |
| 3751 | 0 |
| 3752 | 0 |
| 3753 | 0 |
| 3754 | 0.02 |
| 3755 | 0.06 |
| 3756 | 0.13 |
| 3757 | 0.19 |
| 3758 | 0.21 |
| 3759 | 0.17 |
| 3760 | 0.13 |
| 3761 | 0.06 |
| 3762 | 0.04 |
| 3763 | 0.06 |
| 3764 | 0.09 |
| 3765 | 0.09 |
| 3766 | 0.04 |
| 3767 | -0.04 |
| 3768 | -0.19 |
| 3769 | -0.26 |
| 3770 | -0.28 |
| 3771 | -0.19 |
| 3772 | -0.09 |
| 3773 | 0 |
| 3774 | 0.04 |
| 3775 | 0.02 |
| 3776 | -0.04 |
| 3777 | -0.13 |
| 3778 | -0.19 |
| 3779 | -0.19 |
| 3780 | -0.19 |
| 3781 | -0.17 |
| 3782 | -0.19 |
| 3783 | -0.26 |
| 3784 | -0.3 |
| 3785 | -0.3 |
| 3786 | -0.28 |
| 3787 | -0.19 |
| 3788 | -0.11 |
| 3789 | -0.02 |
| 3790 | 0 |
| 3791 | -0.02 |
| 3792 | -0.04 |
| 3793 | -0.06 |
| 3794 | -0.09 |
| 3795 | -0.13 |
| 3796 | -0.15 |
| 3797 | -0.21 |
| 3798 | -0.24 |
| 3799 | -0.26 |
| 3800 | -0.26 |
| 3801 | -0.21 |
| 3802 | -0.21 |
| 3803 | -0.19 |
| 3804 | -0.21 |
| 3805 | -0.24 |
| 3806 | -0.24 |
| 3807 | -0.24 |
| 3808 | -0.17 |
| 3809 | -0.09 |
| 3810 | 0.04 |
| 3811 | 0.13 |
| 3812 | 0.19 |
| 3813 | 0.17 |
| 3814 | 0.13 |
| 3815 | 0.06 |
| 3816 | 0 |
| 3817 | -0.09 |
| 3818 | -0.13 |
| 3819 | -0.15 |
| 3820 | -0.11 |
| 3821 | -0.09 |
| 3822 | -0.04 |
| 3823 | -0.09 |
| 3824 | -0.09 |
| 3825 | -0.17 |
| 3826 | -0.24 |
| 3827 | -0.28 |
| 3828 | -0.26 |
| 3829 | -0.21 |
| 3830 | -0.13 |
| 3831 | -0.09 |
| 3832 | -0.04 |
| 3833 | -0.04 |
| 3834 | -0.06 |
| 3835 | -0.06 |
| 3836 | -0.09 |
| 3837 | -0.09 |
| 3838 | -0.06 |
| 3839 | 0 |
| 3840 | 0.04 |
| 3841 | 0.11 |
| 3842 | 0.13 |
| 3843 | 0.15 |
| 3844 | 0.11 |
| 3845 | 0.02 |
| 3846 | -0.06 |
| 3847 | -0.17 |
| 3848 | -0.21 |
| 3849 | -0.17 |
| 3850 | -0.11 |
| 3851 | -0.02 |
| 3852 | 0.09 |
| 3853 | 0.11 |
| 3854 | 0.11 |
| 3855 | 0.09 |
| 3856 | 0.02 |
| 3857 | 0 |
| 3858 | 0 |
| 3859 | -0.04 |
| 3860 | -0.02 |
| 3861 | -0.06 |
| 3862 | -0.09 |
| 3863 | -0.11 |
| 3864 | -0.11 |
| 3865 | -0.02 |
| 3866 | 0.04 |
| 3867 | 0.13 |
| 3868 | 0.17 |
| 3869 | 0.15 |
| 3870 | 0.13 |
| 3871 | 0.04 |
| 3872 | -0.04 |
| 3873 | -0.09 |
| 3874 | -0.09 |
| 3875 | -0.06 |
| 3876 | -0.02 |
| 3877 | 0.02 |
| 3878 | 0.06 |
| 3879 | 0.06 |
| 3880 | 0.04 |
| 3881 | -0.02 |
| 3882 | -0.11 |
| 3883 | -0.19 |
| 3884 | -0.28 |
| 3885 | -0.3 |
| 3886 | -0.3 |
| 3887 | -0.26 |
| 3888 | -0.17 |
| 3889 | -0.06 |
| 3890 | 0.04 |
| 3891 | 0.11 |
| 3892 | 0.11 |
| 3893 | 0.11 |
| 3894 | 0.02 |
| 3895 | -0.11 |
| 3896 | -0.19 |
| 3897 | -0.26 |
| 3898 | -0.26 |
| 3899 | -0.24 |
| 3900 | -0.15 |
| 3901 | -0.06 |
| 3902 | -0.02 |
| 3903 | 0 |
| 3904 | -0.04 |
| 3905 | -0.13 |
| 3906 | -0.26 |
| 3907 | -0.34 |
| 3908 | -0.37 |
| 3909 | -0.32 |
| 3910 | -0.24 |
| 3911 | -0.09 |
| 3912 | 0.02 |
| 3913 | 0.06 |
| 3914 | 0.04 |
| 3915 | 0.04 |
| 3916 | 0.02 |
| 3917 | 0.02 |
| 3918 | 0.06 |
| 3919 | 0.04 |
| 3920 | 0.04 |
| 3921 | 0 |
| 3922 | -0.09 |
| 3923 | -0.11 |
| 3924 | -0.13 |
| 3925 | -0.13 |
| 3926 | -0.09 |
| 3927 | -0.06 |
| 3928 | -0.06 |
| 3929 | -0.09 |
| 3930 | -0.11 |
| 3931 | -0.09 |
| 3932 | -0.06 |
| 3933 | -0.06 |
| 3934 | -0.02 |
| 3935 | 0.02 |
| 3936 | 0.06 |
| 3937 | 0.09 |
| 3938 | 0.11 |
| 3939 | 0.11 |
| 3940 | 0.04 |
| 3941 | -0.02 |
| 3942 | -0.09 |
| 3943 | -0.15 |
| 3944 | -0.15 |
| 3945 | -0.13 |
| 3946 | -0.13 |
| 3947 | -0.11 |
| 3948 | -0.15 |
| 3949 | -0.21 |
| 3950 | -0.28 |
| 3951 | -0.32 |
| 3952 | -0.32 |
| 3953 | -0.26 |
| 3954 | -0.17 |
| 3955 | -0.06 |
| 3956 | 0 |
| 3957 | 0 |
| 3958 | -0.02 |
| 3959 | -0.04 |
| 3960 | -0.06 |
| 3961 | -0.06 |
| 3962 | 0.02 |
| 3963 | 0.06 |
| 3964 | 0.11 |
| 3965 | 0.11 |
| 3966 | 0.06 |
| 3967 | 0.09 |
| 3968 | 0.13 |
| 3969 | 0.24 |
| 3970 | 0.3 |
| 3971 | 0.28 |
| 3972 | 0.19 |
| 3973 | 0.02 |
| 3974 | -0.11 |
| 3975 | -0.13 |
| 3976 | -0.09 |
| 3977 | 0 |
| 3978 | 0.06 |
| 3979 | 0.09 |
| 3980 | 0.09 |
| 3981 | 0.04 |
| 3982 | 0.02 |
| 3983 | 0.04 |
| 3984 | 0.06 |
| 3985 | 0.11 |
| 3986 | 0.15 |
| 3987 | 0.17 |
| 3988 | 0.17 |
| 3989 | 0.13 |
| 3990 | 0.06 |
| 3991 | 0 |
| 3992 | -0.04 |
| 3993 | -0.04 |
| 3994 | 0 |
| 3995 | 0.06 |
| 3996 | 0.15 |
| 3997 | 0.15 |
| 3998 | 0.13 |
| 3999 | 0.09 |
| 4000 | 0.02 |
| 4001 | -0.04 |
| 4002 | -0.13 |
| 4003 | -0.21 |
| 4004 | -0.32 |
| 4005 | -0.43 |
| 4006 | -0.54 |
| 4007 | -0.58 |
| 4008 | -0.58 |
| 4009 | -0.47 |
| 4010 | -0.37 |
| 4011 | -0.19 |
| 4012 | -0.04 |
| 4013 | 0.09 |
| 4014 | 0.19 |
| 4015 | 0.21 |
| 4016 | 0.17 |
| 4017 | 0.09 |
| 4018 | 0.02 |
| 4019 | -0.04 |
| 4020 | -0.09 |
| 4021 | -0.09 |
| 4022 | -0.09 |
| 4023 | -0.06 |
| 4024 | -0.02 |
| 4025 | 0 |
| 4026 | 0.06 |
| 4027 | 0.13 |
| 4028 | 0.19 |
| 4029 | 0.17 |
| 4030 | 0.13 |
| 4031 | 0.04 |
| 4032 | 0 |
| 4033 | -0.02 |
| 4034 | -0.02 |
| 4035 | -0.02 |
| 4036 | -0.02 |
| 4037 | -0.09 |
| 4038 | -0.19 |
| 4039 | -0.26 |
| 4040 | -0.3 |
| 4041 | -0.28 |
| 4042 | -0.24 |
| 4043 | -0.17 |
| 4044 | -0.15 |
| 4045 | -0.15 |
| 4046 | -0.15 |
| 4047 | -0.13 |
| 4048 | -0.09 |
| 4049 | 0.04 |
| 4050 | 0.11 |
| 4051 | 0.17 |
| 4052 | 0.13 |
| 4053 | 0.02 |
| 4054 | -0.09 |
| 4055 | -0.17 |
| 4056 | -0.26 |
| 4057 | -0.26 |
| 4058 | -0.21 |
| 4059 | -0.17 |
| 4060 | -0.09 |
| 4061 | -0.04 |
| 4062 | 0.02 |
| 4063 | 0.02 |
| 4064 | 0 |
| 4065 | -0.06 |
| 4066 | -0.19 |
| 4067 | -0.3 |
| 4068 | -0.37 |
| 4069 | -0.39 |
| 4070 | -0.34 |
| 4071 | -0.26 |
| 4072 | -0.15 |
| 4073 | -0.06 |
| 4074 | 0.02 |
| 4075 | 0 |
| 4076 | -0.04 |
| 4077 | -0.11 |
| 4078 | -0.15 |
| 4079 | -0.19 |
| 4080 | -0.21 |
| 4081 | -0.17 |
| 4082 | -0.09 |
| 4083 | 0 |
| 4084 | 0.09 |
| 4085 | 0.15 |
| 4086 | 0.13 |
| 4087 | 0.06 |
| 4088 | -0.04 |
| 4089 | -0.17 |
| 4090 | -0.24 |
| 4091 | -0.24 |
| 4092 | -0.17 |
| 4093 | -0.02 |
| 4094 | 0.04 |
| 4095 | 0.13 |
| 4096 | 0.13 |
| 4097 | 0.02 |
| 4098 | -0.13 |
| 4099 | -0.24 |
| 4100 | -0.3 |
| 4101 | -0.28 |
| 4102 | -0.24 |
| 4103 | -0.17 |
| 4104 | -0.11 |
| 4105 | -0.09 |
| 4106 | -0.15 |
| 4107 | -0.19 |
| 4108 | -0.24 |
| 4109 | -0.26 |
| 4110 | -0.28 |
| 4111 | -0.26 |
| 4112 | -0.26 |
| 4113 | -0.24 |
| 4114 | -0.21 |
| 4115 | -0.15 |
| 4116 | -0.17 |
| 4117 | -0.21 |
| 4118 | -0.28 |
| 4119 | -0.32 |
| 4120 | -0.34 |
| 4121 | -0.26 |
| 4122 | -0.17 |
| 4123 | -0.06 |
| 4124 | 0.02 |
| 4125 | 0 |
| 4126 | -0.04 |
| 4127 | -0.09 |
| 4128 | -0.15 |
| 4129 | -0.13 |
| 4130 | -0.11 |
| 4131 | -0.02 |
| 4132 | 0.02 |
| 4133 | 0.02 |
| 4134 | 0 |
| 4135 | -0.04 |
| 4136 | -0.09 |
| 4137 | -0.11 |
| 4138 | -0.13 |
| 4139 | -0.11 |
| 4140 | -0.15 |
| 4141 | -0.17 |
| 4142 | -0.17 |
| 4143 | -0.21 |
| 4144 | -0.19 |
| 4145 | -0.15 |
| 4146 | -0.11 |
| 4147 | -0.04 |
| 4148 | 0 |
| 4149 | 0.06 |
| 4150 | 0.06 |
| 4151 | 0.11 |
| 4152 | 0.13 |
| 4153 | 0.13 |
| 4154 | 0.13 |
| 4155 | 0.04 |
| 4156 | -0.09 |
| 4157 | -0.21 |
| 4158 | -0.34 |
| 4159 | -0.39 |
| 4160 | -0.34 |
| 4161 | -0.26 |
| 4162 | -0.15 |
| 4163 | -0.09 |
| 4164 | -0.11 |
| 4165 | -0.13 |
| 4166 | -0.19 |
| 4167 | -0.19 |
| 4168 | -0.15 |
| 4169 | -0.06 |
| 4170 | 0.02 |
| 4171 | 0.06 |
| 4172 | 0.11 |
| 4173 | 0.13 |
| 4174 | 0.06 |
| 4175 | -0.02 |
| 4176 | -0.06 |
| 4177 | -0.13 |
| 4178 | -0.19 |
| 4179 | -0.19 |
| 4180 | -0.21 |
| 4181 | -0.19 |
| 4182 | -0.19 |
| 4183 | -0.24 |
| 4184 | -0.32 |
| 4185 | -0.41 |
| 4186 | -0.43 |
| 4187 | -0.39 |
| 4188 | -0.26 |
| 4189 | -0.13 |
| 4190 | 0.02 |
| 4191 | 0.06 |
| 4192 | 0.06 |
| 4193 | -0.04 |
| 4194 | -0.15 |
| 4195 | -0.21 |
| 4196 | -0.24 |
| 4197 | -0.19 |
| 4198 | -0.09 |
| 4199 | -0.02 |
| 4200 | 0.04 |
| 4201 | 0.02 |
| 4202 | -0.02 |
| 4203 | -0.09 |
| 4204 | -0.17 |
| 4205 | -0.17 |
| 4206 | -0.15 |
| 4207 | -0.06 |
| 4208 | 0.02 |
| 4209 | 0.06 |
| 4210 | 0.04 |
| 4211 | -0.04 |
| 4212 | -0.17 |
| 4213 | -0.32 |
| 4214 | -0.37 |
| 4215 | -0.37 |
| 4216 | -0.28 |
| 4217 | -0.17 |
| 4218 | -0.04 |
| 4219 | 0.06 |
| 4220 | 0.09 |
| 4221 | 0.04 |
| 4222 | -0.06 |
| 4223 | -0.17 |
| 4224 | -0.28 |
| 4225 | -0.32 |
| 4226 | -0.3 |
| 4227 | -0.24 |
| 4228 | -0.21 |
| 4229 | -0.17 |
| 4230 | -0.17 |
| 4231 | -0.15 |
| 4232 | -0.17 |
| 4233 | -0.13 |
| 4234 | -0.06 |
| 4235 | -0.02 |
| 4236 | 0 |
| 4237 | 0 |
| 4238 | 0 |
| 4239 | -0.02 |
| 4240 | -0.04 |
| 4241 | -0.02 |
| 4242 | 0 |
| 4243 | 0.04 |
| 4244 | 0.11 |
| 4245 | 0.09 |
| 4246 | 0.02 |
| 4247 | -0.04 |
| 4248 | -0.15 |
| 4249 | -0.24 |
| 4250 | -0.28 |
| 4251 | -0.28 |
| 4252 | -0.26 |
| 4253 | -0.17 |
| 4254 | -0.11 |
| 4255 | -0.06 |
| 4256 | 0 |
| 4257 | 0.06 |
| 4258 | 0.09 |
| 4259 | 0.09 |
| 4260 | 0.09 |
| 4261 | 0.02 |
| 4262 | 0 |
| 4263 | -0.06 |
| 4264 | -0.06 |
| 4265 | -0.06 |
| 4266 | -0.06 |
| 4267 | -0.06 |
| 4268 | -0.15 |
| 4269 | -0.21 |
| 4270 | -0.3 |
| 4271 | -0.32 |
| 4272 | -0.28 |
| 4273 | -0.19 |
| 4274 | -0.06 |
| 4275 | 0.06 |
| 4276 | 0.13 |
| 4277 | 0.11 |
| 4278 | 0.06 |
| 4279 | -0.04 |
| 4280 | -0.17 |